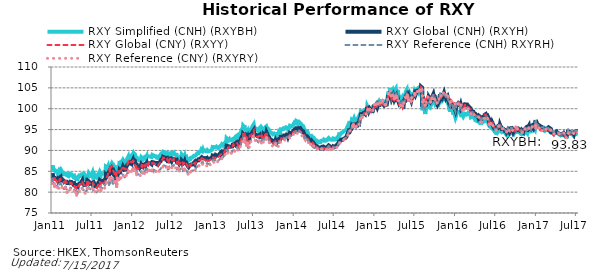
| Category | RXY Simplified (CNH) (RXYBH) | RXY Global (CNH) (RXYH) | RXY Global (CNY) (RXYY) | RXY Reference (CNH) RXYRH) | RXY Reference (CNY) (RXYRY) |
|---|---|---|---|---|---|
| 2017-07-15 | 93.83 | 94.36 | 94.14 | 94.45 | 94.23 |
| 2017-07-14 | 93.82 | 94.37 | 94.18 | 94.46 | 94.27 |
| 2017-07-13 | 93.89 | 94.44 | 94.23 | 94.55 | 94.34 |
| 2017-07-12 | 93.9 | 94.54 | 94.35 | 94.68 | 94.49 |
| 2017-07-11 | 93.97 | 94.63 | 94.47 | 94.78 | 94.63 |
| 2017-07-10 | 93.93 | 94.54 | 94.34 | 94.64 | 94.44 |
| 2017-07-07 | 93.89 | 94.57 | 94.37 | 94.73 | 94.54 |
| 2017-07-06 | 93.92 | 94.61 | 94.4 | 94.76 | 94.55 |
| 2017-07-05 | 93.97 | 94.57 | 94.37 | 94.69 | 94.5 |
| 2017-07-04 | 93.93 | 94.52 | 94.31 | 94.64 | 94.43 |
| 2017-07-03 | 93.89 | 94.49 | 94.25 | 94.6 | 94.37 |
| 2017-06-30 | 93.83 | 94.45 | 94.24 | 94.57 | 94.36 |
| 2017-06-29 | 93.84 | 94.41 | 94.27 | 94.49 | 94.35 |
| 2017-06-28 | 93.8 | 94.33 | 94.17 | 94.43 | 94.27 |
| 2017-06-27 | 93.79 | 94.19 | 93.97 | 94.25 | 94.02 |
| 2017-06-26 | 93.54 | 93.91 | 93.82 | 93.98 | 93.89 |
| 2017-06-23 | 93.69 | 94.1 | 93.86 | 94.19 | 93.96 |
| 2017-06-22 | 93.84 | 94.28 | 94.09 | 94.39 | 94.2 |
| 2017-06-21 | 93.97 | 94.43 | 94.23 | 94.56 | 94.35 |
| 2017-06-20 | 93.8 | 94.14 | 93.94 | 94.24 | 94.04 |
| 2017-06-19 | 93.78 | 94.1 | 93.95 | 94.18 | 94.03 |
| 2017-06-16 | 93.88 | 94.19 | 94.09 | 94.28 | 94.18 |
| 2017-06-15 | 94 | 94.25 | 93.95 | 94.35 | 94.05 |
| 2017-06-14 | 94.08 | 94.26 | 93.96 | 94.36 | 94.06 |
| 2017-06-13 | 94.11 | 94.32 | 94.03 | 94.43 | 94.13 |
| 2017-06-12 | 94.1 | 94.35 | 94.08 | 94.47 | 94.2 |
| 2017-06-09 | 94.25 | 94.44 | 94.1 | 94.57 | 94.23 |
| 2017-06-08 | 94.07 | 94.32 | 93.88 | 94.47 | 94.03 |
| 2017-06-07 | 94.09 | 94.34 | 93.85 | 94.49 | 94 |
| 2017-06-06 | 94.25 | 94.4 | 93.84 | 94.54 | 93.99 |
| 2017-06-05 | 94.22 | 94.35 | 93.84 | 94.47 | 93.96 |
| 2017-06-02 | 94.46 | 94.56 | 94 | 94.71 | 94.16 |
| 2017-06-01 | 94.77 | 94.9 | 94.1 | 95.04 | 94.23 |
| 2017-05-31 | 94.54 | 94.64 | 93.74 | 94.81 | 93.91 |
| 2017-05-30 | 93.97 | 94.09 | 93.45 | 94.22 | 93.58 |
| 2017-05-29 | 94.01 | 94.11 | 93.37 | 94.27 | 93.52 |
| 2017-05-26 | 93.69 | 93.79 | 93.32 | 93.95 | 93.47 |
| 2017-05-25 | 93.32 | 93.39 | 93.06 | 93.58 | 93.24 |
| 2017-05-24 | 93.27 | 93.44 | 93.1 | 93.56 | 93.22 |
| 2017-05-23 | 92.96 | 93.18 | 92.84 | 93.29 | 92.95 |
| 2017-05-22 | 93.2 | 93.32 | 92.96 | 93.51 | 93.15 |
| 2017-05-19 | 93.25 | 93.49 | 93.2 | 93.61 | 93.32 |
| 2017-05-18 | 93.26 | 93.51 | 93.15 | 93.66 | 93.31 |
| 2017-05-17 | 93.62 | 93.69 | 93.37 | 93.93 | 93.61 |
| 2017-05-16 | 93.8 | 93.78 | 93.47 | 94.07 | 93.76 |
| 2017-05-15 | 93.91 | 93.94 | 93.71 | 94.18 | 93.96 |
| 2017-05-12 | 94.06 | 94.12 | 93.92 | 94.37 | 94.17 |
| 2017-05-11 | 94.07 | 94.11 | 93.95 | 94.35 | 94.2 |
| 2017-05-10 | 93.97 | 94.13 | 94.02 | 94.29 | 94.18 |
| 2017-05-09 | 93.87 | 94.01 | 93.86 | 94.2 | 94.05 |
| 2017-05-08 | 93.66 | 93.85 | 93.65 | 94.01 | 93.81 |
| 2017-05-05 | 93.62 | 93.86 | 93.72 | 94.01 | 93.87 |
| 2017-05-04 | 93.89 | 94.07 | 93.85 | 94.23 | 94.01 |
| 2017-05-03 | 93.71 | 93.89 | 93.65 | 94.04 | 93.8 |
| 2017-05-02 | 93.65 | 93.86 | 93.61 | 94.01 | 93.77 |
| 2017-05-01 | 93.62 | 93.89 | 93.72 | 93.98 | 93.8 |
| 2017-04-28 | 93.59 | 93.87 | 93.67 | 93.95 | 93.75 |
| 2017-04-27 | 93.53 | 93.72 | 93.6 | 93.87 | 93.75 |
| 2017-04-26 | 93.58 | 93.7 | 93.55 | 93.9 | 93.75 |
| 2017-04-25 | 93.57 | 93.73 | 93.52 | 93.9 | 93.69 |
| 2017-04-24 | 93.58 | 93.78 | 93.58 | 93.92 | 93.71 |
| 2017-04-21 | 93.87 | 94.05 | 93.84 | 94.16 | 93.96 |
| 2017-04-20 | 93.84 | 94.08 | 93.81 | 94.13 | 93.86 |
| 2017-04-19 | 93.83 | 94.04 | 93.8 | 94.09 | 93.85 |
| 2017-04-18 | 94.01 | 94.21 | 93.96 | 94.26 | 94.01 |
| 2017-04-17 | 93.96 | 94.15 | 93.87 | 94.23 | 93.95 |
| 2017-04-14 | 94.11 | 94.2 | 94.02 | 94.39 | 94.22 |
| 2017-04-13 | 94.03 | 94.18 | 93.91 | 94.36 | 94.09 |
| 2017-04-12 | 94.12 | 94.31 | 94.16 | 94.4 | 94.25 |
| 2017-04-11 | 94.21 | 94.41 | 94.26 | 94.48 | 94.34 |
| 2017-04-10 | 94.34 | 94.51 | 94.31 | 94.65 | 94.45 |
| 2017-04-07 | 94.24 | 94.39 | 94.1 | 94.57 | 94.28 |
| 2017-04-06 | 94.23 | 94.36 | 94.04 | 94.54 | 94.23 |
| 2017-04-05 | 94.24 | 94.28 | 93.88 | 94.54 | 94.14 |
| 2017-04-04 | 94.33 | 94.37 | 93.99 | 94.67 | 94.28 |
| 2017-04-03 | 94.35 | 94.3 | 93.87 | 94.66 | 94.23 |
| 2017-03-31 | 94.23 | 94.22 | 93.89 | 94.55 | 94.21 |
| 2017-03-30 | 94.06 | 94.1 | 93.73 | 94.42 | 94.05 |
| 2017-03-29 | 94.09 | 94.15 | 93.69 | 94.49 | 94.03 |
| 2017-03-28 | 93.95 | 94.01 | 93.56 | 94.33 | 93.89 |
| 2017-03-27 | 94.02 | 94.1 | 93.59 | 94.41 | 93.9 |
| 2017-03-24 | 94.09 | 94.22 | 93.83 | 94.49 | 94.1 |
| 2017-03-23 | 94.12 | 94.27 | 93.84 | 94.53 | 94.1 |
| 2017-03-22 | 94.16 | 94.35 | 93.87 | 94.61 | 94.13 |
| 2017-03-21 | 94.06 | 94.2 | 93.87 | 94.51 | 94.17 |
| 2017-03-20 | 93.94 | 94.1 | 93.72 | 94.41 | 94.02 |
| 2017-03-17 | 94.22 | 94.46 | 94.06 | 94.69 | 94.3 |
| 2017-03-16 | 94.58 | 94.84 | 94.29 | 95.07 | 94.52 |
| 2017-03-15 | 94.83 | 95.14 | 94.68 | 95.32 | 94.86 |
| 2017-03-14 | 94.78 | 95.1 | 94.74 | 95.25 | 94.88 |
| 2017-03-13 | 94.7 | 95.05 | 94.68 | 95.21 | 94.84 |
| 2017-03-10 | 94.94 | 95.32 | 95 | 95.39 | 95.07 |
| 2017-03-09 | 95.01 | 95.37 | 95.06 | 95.44 | 95.14 |
| 2017-03-08 | 94.68 | 94.94 | 94.84 | 95.11 | 95 |
| 2017-03-07 | 94.73 | 95.02 | 94.76 | 95.16 | 94.89 |
| 2017-03-06 | 94.77 | 95.17 | 94.92 | 95.19 | 94.94 |
| 2017-03-03 | 94.99 | 95.32 | 95.06 | 95.39 | 95.13 |
| 2017-03-02 | 95.1 | 95.32 | 95.01 | 95.52 | 95.21 |
| 2017-03-01 | 95.07 | 95.2 | 94.85 | 95.49 | 95.14 |
| 2017-02-28 | 94.89 | 95.06 | 94.66 | 95.31 | 94.91 |
| 2017-02-27 | 94.83 | 94.99 | 94.62 | 95.2 | 94.84 |
| 2017-02-24 | 94.9 | 95.06 | 94.62 | 95.29 | 94.85 |
| 2017-02-23 | 95.06 | 95.2 | 94.82 | 95.4 | 95.02 |
| 2017-02-22 | 95.17 | 95.31 | 94.93 | 95.47 | 95.09 |
| 2017-02-21 | 95.1 | 95.28 | 94.81 | 95.41 | 94.94 |
| 2017-02-20 | 95.12 | 95.36 | 94.82 | 95.45 | 94.91 |
| 2017-02-17 | 94.99 | 95.22 | 94.8 | 95.31 | 94.88 |
| 2017-02-16 | 95.27 | 95.39 | 94.98 | 95.55 | 95.13 |
| 2017-02-15 | 95.38 | 95.43 | 95.03 | 95.59 | 95.2 |
| 2017-02-14 | 95.04 | 95.13 | 94.8 | 95.32 | 94.99 |
| 2017-02-13 | 94.8 | 95.06 | 94.81 | 95.1 | 94.85 |
| 2017-02-10 | 95.03 | 95.29 | 94.91 | 95.37 | 94.98 |
| 2017-02-09 | 94.91 | 95.18 | 94.83 | 95.27 | 94.91 |
| 2017-02-08 | 94.97 | 95.27 | 94.66 | 95.35 | 94.74 |
| 2017-02-07 | 95.24 | 95.51 | 94.63 | 95.61 | 94.73 |
| 2017-02-06 | 95.29 | 95.52 | 94.58 | 95.66 | 94.72 |
| 2017-02-03 | 95.25 | 95.58 | 94.67 | 95.63 | 94.72 |
| 2017-02-02 | 95.09 | 95.48 | 94.45 | 95.53 | 94.5 |
| 2017-02-01 | 95.09 | 95.55 | 94.76 | 95.51 | 94.73 |
| 2017-01-31 | 95.07 | 95.49 | 94.98 | 95.44 | 94.93 |
| 2017-01-30 | 95.11 | 95.45 | 95.11 | 95.45 | 95.12 |
| 2017-01-27 | 95.21 | 95.51 | 95.22 | 95.53 | 95.24 |
| 2017-01-26 | 95.3 | 95.71 | 94.84 | 95.68 | 94.81 |
| 2017-01-25 | 95.43 | 95.86 | 94.99 | 95.77 | 94.9 |
| 2017-01-24 | 95.53 | 96.02 | 95.26 | 95.92 | 95.16 |
| 2017-01-23 | 95.42 | 95.93 | 95.25 | 95.83 | 95.16 |
| 2017-01-20 | 95.57 | 96.05 | 95.43 | 95.96 | 95.35 |
| 2017-01-19 | 95.77 | 96.27 | 95.62 | 96.12 | 95.47 |
| 2017-01-18 | 95.74 | 96.17 | 95.58 | 96.08 | 95.49 |
| 2017-01-17 | 95.66 | 96.17 | 95.29 | 96.02 | 95.14 |
| 2017-01-16 | 95.62 | 96.13 | 95.41 | 95.94 | 95.22 |
| 2017-01-13 | 95.83 | 96.27 | 95.33 | 96.15 | 95.21 |
| 2017-01-12 | 95.2 | 95.74 | 95.14 | 95.51 | 94.91 |
| 2017-01-11 | 95.53 | 96.09 | 95.53 | 95.82 | 95.26 |
| 2017-01-10 | 95.6 | 96.16 | 95.44 | 95.89 | 95.18 |
| 2017-01-09 | 96.16 | 96.76 | 95.8 | 96.41 | 95.45 |
| 2017-01-06 | 96.19 | 96.71 | 95.5 | 96.47 | 95.26 |
| 2017-01-05 | 96.79 | 97.3 | 96.14 | 97.12 | 95.97 |
| 2017-01-04 | 95.9 | 96.47 | 95.92 | 96.2 | 95.66 |
| 2017-01-03 | 95.29 | 95.81 | 95.79 | 95.56 | 95.54 |
| 2017-01-02 | 94.98 | 95.59 | 95.7 | 95.27 | 95.37 |
| 2016-12-30 | 94.87 | 95.47 | 95.73 | 95.15 | 95.41 |
| 2016-12-29 | 95.09 | 95.66 | 95.71 | 95.35 | 95.4 |
| 2016-12-28 | 95.4 | 96.01 | 95.86 | 95.69 | 95.53 |
| 2016-12-27 | 95.45 | 96.03 | 95.92 | 95.74 | 95.63 |
| 2016-12-26 | 95.43 | 95.98 | 95.87 | 95.73 | 95.62 |
| 2016-12-23 | 95.56 | 96.1 | 95.88 | 95.86 | 95.63 |
| 2016-12-22 | 95.65 | 96.14 | 95.86 | 95.93 | 95.65 |
| 2016-12-21 | 95.67 | 96.14 | 95.79 | 95.98 | 95.64 |
| 2016-12-20 | 95.66 | 96.14 | 95.86 | 96 | 95.72 |
| 2016-12-19 | 95.34 | 95.8 | 95.61 | 95.69 | 95.49 |
| 2016-12-16 | 95.57 | 96.02 | 95.6 | 95.94 | 95.53 |
| 2016-12-15 | 95.31 | 95.75 | 95.52 | 95.7 | 95.47 |
| 2016-12-14 | 94.57 | 95.07 | 95.04 | 94.99 | 94.96 |
| 2016-12-13 | 94.52 | 94.97 | 95.13 | 94.93 | 95.09 |
| 2016-12-12 | 94.73 | 95.12 | 95.22 | 95.1 | 95.2 |
| 2016-12-09 | 94.55 | 95.12 | 95.23 | 95.1 | 95.21 |
| 2016-12-08 | 94.44 | 95.06 | 95.05 | 95.06 | 95.06 |
| 2016-12-07 | 94.6 | 95.25 | 95.27 | 95.2 | 95.21 |
| 2016-12-06 | 94.76 | 95.52 | 95.31 | 95.4 | 95.19 |
| 2016-12-05 | 95.2 | 95.91 | 95.51 | 95.81 | 95.41 |
| 2016-12-02 | 95.06 | 95.79 | 95.53 | 95.7 | 95.44 |
| 2016-12-01 | 94.93 | 95.55 | 95.48 | 95.53 | 95.46 |
| 2016-11-30 | 94.68 | 95.47 | 95.47 | 95.42 | 95.42 |
| 2016-11-29 | 94.52 | 95.28 | 95.38 | 95.23 | 95.33 |
| 2016-11-28 | 94.18 | 94.99 | 95.08 | 94.9 | 94.99 |
| 2016-11-25 | 94.35 | 95.14 | 95.25 | 95.03 | 95.14 |
| 2016-11-24 | 94.47 | 95.19 | 95.42 | 95.08 | 95.3 |
| 2016-11-23 | 94.28 | 95.06 | 95.22 | 94.91 | 95.08 |
| 2016-11-22 | 94.45 | 95.16 | 95.23 | 95.01 | 95.08 |
| 2016-11-21 | 94.52 | 95.34 | 95.33 | 95.09 | 95.09 |
| 2016-11-18 | 94.5 | 95.35 | 95.41 | 95.15 | 95.21 |
| 2016-11-17 | 94.24 | 95.13 | 95.09 | 94.92 | 94.88 |
| 2016-11-16 | 94.25 | 95.04 | 94.98 | 94.9 | 94.84 |
| 2016-11-15 | 94.07 | 95.01 | 94.93 | 94.81 | 94.73 |
| 2016-11-14 | 94.28 | 95.24 | 95.17 | 95.02 | 94.95 |
| 2016-11-11 | 94 | 94.91 | 94.92 | 94.7 | 94.71 |
| 2016-11-10 | 93.94 | 94.7 | 94.74 | 94.58 | 94.62 |
| 2016-11-09 | 93.48 | 94.36 | 94.39 | 94.17 | 94.2 |
| 2016-11-08 | 93.71 | 94.4 | 94.36 | 94.38 | 94.33 |
| 2016-11-07 | 93.8 | 94.58 | 94.52 | 94.49 | 94.42 |
| 2016-11-04 | 93.71 | 94.55 | 94.47 | 94.42 | 94.33 |
| 2016-11-03 | 93.63 | 94.4 | 94.33 | 94.3 | 94.22 |
| 2016-11-02 | 93.89 | 94.7 | 94.62 | 94.52 | 94.44 |
| 2016-11-01 | 94.11 | 94.78 | 94.67 | 94.74 | 94.63 |
| 2016-10-31 | 94.3 | 94.97 | 94.9 | 94.9 | 94.84 |
| 2016-10-28 | 94.35 | 94.96 | 94.9 | 94.91 | 94.85 |
| 2016-10-27 | 94.27 | 94.91 | 94.8 | 94.86 | 94.75 |
| 2016-10-26 | 94.17 | 94.72 | 94.65 | 94.73 | 94.67 |
| 2016-10-25 | 94.33 | 94.79 | 94.68 | 94.83 | 94.72 |
| 2016-10-24 | 94.34 | 94.82 | 94.7 | 94.87 | 94.76 |
| 2016-10-21 | 94.44 | 94.96 | 94.88 | 94.98 | 94.9 |
| 2016-10-20 | 94.46 | 94.96 | 94.84 | 95.02 | 94.9 |
| 2016-10-19 | 94.42 | 94.9 | 94.75 | 94.99 | 94.84 |
| 2016-10-18 | 94.41 | 94.99 | 94.85 | 95.02 | 94.89 |
| 2016-10-17 | 94.64 | 95.28 | 95.2 | 95.27 | 95.19 |
| 2016-10-14 | 94.7 | 95.3 | 95.24 | 95.34 | 95.27 |
| 2016-10-13 | 94.72 | 95.42 | 95.35 | 95.42 | 95.36 |
| 2016-10-12 | 94.67 | 95.27 | 95.11 | 95.36 | 95.21 |
| 2016-10-11 | 94.62 | 95.12 | 94.98 | 95.23 | 95.1 |
| 2016-10-10 | 94.41 | 94.86 | 94.74 | 95.06 | 94.94 |
| 2016-10-07 | 94.63 | 95.09 | 95.45 | 95.23 | 95.6 |
| 2016-10-06 | 94.51 | 94.97 | 95.14 | 95.11 | 95.28 |
| 2016-10-05 | 94.36 | 94.88 | 94.98 | 94.99 | 95.08 |
| 2016-10-04 | 94.43 | 94.89 | 94.88 | 95.05 | 95.04 |
| 2016-10-03 | 94.2 | 94.66 | 94.55 | 94.85 | 94.74 |
| 2016-09-30 | 94.24 | 94.7 | 94.64 | 94.9 | 94.85 |
| 2016-09-29 | 94.14 | 94.58 | 94.51 | 94.8 | 94.72 |
| 2016-09-28 | 94.03 | 94.56 | 94.52 | 94.8 | 94.76 |
| 2016-09-27 | 93.92 | 94.43 | 94.39 | 94.65 | 94.61 |
| 2016-09-26 | 94.07 | 94.7 | 94.63 | 94.83 | 94.76 |
| 2016-09-23 | 94.16 | 94.7 | 94.6 | 94.88 | 94.78 |
| 2016-09-22 | 93.94 | 94.54 | 94.45 | 94.69 | 94.61 |
| 2016-09-21 | 94.4 | 95.12 | 95.05 | 95.17 | 95.09 |
| 2016-09-20 | 94.37 | 95.14 | 94.99 | 95.17 | 95.02 |
| 2016-09-19 | 94.66 | 95.36 | 95.14 | 95.44 | 95.22 |
| 2016-09-16 | 94.76 | 95.5 | 94.95 | 95.55 | 95 |
| 2016-09-15 | 94.62 | 95.33 | 95.13 | 95.4 | 95.2 |
| 2016-09-14 | 94.63 | 95.31 | 95.15 | 95.38 | 95.22 |
| 2016-09-13 | 94.1 | 94.82 | 94.74 | 94.85 | 94.77 |
| 2016-09-12 | 94.13 | 94.77 | 94.71 | 94.86 | 94.8 |
| 2016-09-09 | 93.87 | 94.39 | 94.32 | 94.6 | 94.53 |
| 2016-09-08 | 93.89 | 94.36 | 94.24 | 94.6 | 94.48 |
| 2016-09-07 | 93.98 | 94.43 | 94.3 | 94.71 | 94.58 |
| 2016-09-06 | 94.24 | 94.79 | 94.72 | 94.98 | 94.91 |
| 2016-09-05 | 94.3 | 94.83 | 94.79 | 95.02 | 94.98 |
| 2016-09-02 | 94.36 | 95.07 | 95.01 | 95.16 | 95.1 |
| 2016-09-01 | 94.6 | 95.26 | 95.2 | 95.32 | 95.26 |
| 2016-08-31 | 94.58 | 95.14 | 95.08 | 95.26 | 95.21 |
| 2016-08-30 | 94.33 | 94.95 | 94.89 | 94.99 | 94.93 |
| 2016-08-29 | 94.28 | 94.97 | 94.93 | 94.95 | 94.92 |
| 2016-08-26 | 93.76 | 94.41 | 94.4 | 94.43 | 94.42 |
| 2016-08-25 | 93.94 | 94.62 | 94.61 | 94.62 | 94.61 |
| 2016-08-24 | 93.95 | 94.71 | 94.68 | 94.65 | 94.62 |
| 2016-08-23 | 93.92 | 94.66 | 94.6 | 94.64 | 94.58 |
| 2016-08-22 | 94.04 | 94.79 | 94.72 | 94.69 | 94.62 |
| 2016-08-19 | 93.99 | 94.68 | 94.58 | 94.65 | 94.54 |
| 2016-08-18 | 94.11 | 94.71 | 94.62 | 94.76 | 94.67 |
| 2016-08-17 | 94.34 | 94.95 | 94.82 | 95.02 | 94.89 |
| 2016-08-16 | 94.26 | 94.72 | 94.61 | 94.95 | 94.83 |
| 2016-08-15 | 94.47 | 95.02 | 94.91 | 95.18 | 95.07 |
| 2016-08-12 | 94.6 | 95.16 | 95.06 | 95.35 | 95.25 |
| 2016-08-11 | 94.53 | 95.13 | 94.98 | 95.34 | 95.19 |
| 2016-08-10 | 94.4 | 94.96 | 94.86 | 95.21 | 95.11 |
| 2016-08-09 | 94.58 | 95.2 | 95.11 | 95.4 | 95.31 |
| 2016-08-08 | 94.56 | 95.23 | 95.13 | 95.4 | 95.3 |
| 2016-08-05 | 94.41 | 95.16 | 95.06 | 95.27 | 95.17 |
| 2016-08-04 | 94.63 | 95.48 | 95.33 | 95.57 | 95.42 |
| 2016-08-03 | 94.52 | 95.47 | 95.35 | 95.5 | 95.38 |
| 2016-08-02 | 94.55 | 95.37 | 95.24 | 95.5 | 95.36 |
| 2016-08-01 | 94.72 | 95.45 | 95.28 | 95.6 | 95.43 |
| 2016-07-29 | 95.03 | 95.85 | 95.73 | 95.95 | 95.83 |
| 2016-07-28 | 94.99 | 95.81 | 95.69 | 95.86 | 95.75 |
| 2016-07-27 | 95.32 | 96.14 | 96.02 | 96.15 | 96.03 |
| 2016-07-26 | 95 | 95.85 | 95.71 | 95.83 | 95.69 |
| 2016-07-25 | 95.35 | 96.1 | 96.02 | 96.1 | 96.01 |
| 2016-07-22 | 95.34 | 96.07 | 95.92 | 96.07 | 95.91 |
| 2016-07-21 | 95.36 | 96.04 | 95.88 | 96.02 | 95.86 |
| 2016-07-20 | 95.26 | 95.92 | 95.79 | 95.85 | 95.72 |
| 2016-07-19 | 94.76 | 95.38 | 95.35 | 95.33 | 95.29 |
| 2016-07-18 | 94.48 | 95.15 | 95.07 | 95.07 | 94.99 |
| 2016-07-15 | 94.5 | 95.2 | 95.08 | 95.11 | 94.99 |
| 2016-07-14 | 94.51 | 95.23 | 95.13 | 95.12 | 95.03 |
| 2016-07-13 | 94.51 | 95.38 | 95.25 | 95.19 | 95.06 |
| 2016-07-12 | 94.14 | 95.07 | 95.05 | 94.83 | 94.81 |
| 2016-07-11 | 94.37 | 95.24 | 95.2 | 95.04 | 94.99 |
| 2016-07-08 | 94.15 | 95.22 | 95.15 | 94.84 | 94.77 |
| 2016-07-07 | 94.23 | 95.2 | 95.13 | 94.9 | 94.83 |
| 2016-07-06 | 94.29 | 95.36 | 95.3 | 94.96 | 94.9 |
| 2016-07-05 | 94.27 | 95.26 | 95.24 | 94.93 | 94.91 |
| 2016-07-04 | 94.48 | 95.34 | 95.31 | 95.1 | 95.07 |
| 2016-07-01 | 94.65 | 95.51 | 95.47 | 95.3 | 95.26 |
| 2016-06-30 | 94.81 | 95.76 | 95.78 | 95.49 | 95.51 |
| 2016-06-29 | 94.77 | 95.82 | 95.86 | 95.49 | 95.53 |
| 2016-06-28 | 94.65 | 95.8 | 96.02 | 95.36 | 95.58 |
| 2016-06-27 | 94.82 | 96.15 | 96.26 | 95.6 | 95.71 |
| 2016-06-24 | 95.17 | 96.5 | 96.67 | 95.98 | 96.14 |
| 2016-06-23 | 94.99 | 96.13 | 96.06 | 95.79 | 95.72 |
| 2016-06-22 | 95.21 | 96.3 | 96.23 | 95.94 | 95.87 |
| 2016-06-21 | 95.14 | 96.31 | 96.24 | 95.92 | 95.85 |
| 2016-06-20 | 95.22 | 96.43 | 96.33 | 96.01 | 95.91 |
| 2016-06-17 | 95.48 | 96.82 | 96.74 | 96.33 | 96.26 |
| 2016-06-16 | 95.51 | 96.85 | 96.78 | 96.37 | 96.31 |
| 2016-06-15 | 95.78 | 97.05 | 97.07 | 96.6 | 96.63 |
| 2016-06-14 | 95.8 | 97.09 | 96.99 | 96.63 | 96.54 |
| 2016-06-13 | 95.76 | 97 | 96.97 | 96.53 | 96.5 |
| 2016-06-10 | 95.8 | 96.93 | 96.99 | 96.53 | 96.58 |
| 2016-06-09 | 95.7 | 96.73 | 96.59 | 96.37 | 96.23 |
| 2016-06-08 | 95.82 | 96.93 | 96.77 | 96.59 | 96.44 |
| 2016-06-07 | 95.97 | 97.16 | 96.97 | 96.78 | 96.59 |
| 2016-06-06 | 96.17 | 97.61 | 97.43 | 97.04 | 96.87 |
| 2016-06-03 | 96.74 | 98.1 | 97.95 | 97.64 | 97.5 |
| 2016-06-02 | 96.78 | 98.17 | 98.03 | 97.68 | 97.54 |
| 2016-06-01 | 96.83 | 98.25 | 98.13 | 97.72 | 97.6 |
| 2016-05-31 | 97.13 | 98.44 | 98.31 | 97.94 | 97.8 |
| 2016-05-30 | 97.27 | 98.54 | 98.42 | 98.05 | 97.93 |
| 2016-05-27 | 97.12 | 98.33 | 98.2 | 97.91 | 97.78 |
| 2016-05-26 | 97.27 | 98.4 | 98.23 | 97.96 | 97.8 |
| 2016-05-25 | 97.33 | 98.54 | 98.41 | 98.11 | 97.97 |
| 2016-05-24 | 97.32 | 98.71 | 98.64 | 98.18 | 98.11 |
| 2016-05-23 | 97.2 | 98.51 | 98.44 | 98.05 | 97.98 |
| 2016-05-20 | 97.29 | 98.61 | 98.61 | 98.09 | 98.08 |
| 2016-05-19 | 97.22 | 98.54 | 98.63 | 98 | 98.08 |
| 2016-05-18 | 97.12 | 98.29 | 98.36 | 97.8 | 97.86 |
| 2016-05-17 | 96.96 | 98.06 | 98.14 | 97.6 | 97.68 |
| 2016-05-16 | 96.95 | 98.11 | 98.24 | 97.61 | 97.74 |
| 2016-05-13 | 96.97 | 98.03 | 98.14 | 97.6 | 97.71 |
| 2016-05-12 | 96.82 | 97.82 | 98.04 | 97.46 | 97.68 |
| 2016-05-11 | 96.83 | 98 | 98.15 | 97.61 | 97.76 |
| 2016-05-10 | 96.81 | 98.05 | 98.2 | 97.61 | 97.77 |
| 2016-05-09 | 96.94 | 98.08 | 98.05 | 97.68 | 97.65 |
| 2016-05-06 | 96.7 | 97.8 | 97.8 | 97.49 | 97.49 |
| 2016-05-05 | 96.57 | 97.7 | 97.63 | 97.37 | 97.3 |
| 2016-05-04 | 96.5 | 97.64 | 97.58 | 97.29 | 97.22 |
| 2016-05-03 | 96.19 | 97.19 | 97.07 | 96.88 | 96.76 |
| 2016-05-02 | 96.52 | 97.43 | 97.24 | 97.2 | 97.01 |
| 2016-04-29 | 96.73 | 97.59 | 97.45 | 97.36 | 97.23 |
| 2016-04-28 | 96.94 | 97.83 | 97.72 | 97.65 | 97.55 |
| 2016-04-27 | 97.22 | 98.15 | 98.12 | 97.93 | 97.89 |
| 2016-04-26 | 97.15 | 98.24 | 98.21 | 98 | 97.97 |
| 2016-04-25 | 97.25 | 98.26 | 98.19 | 98.07 | 98 |
| 2016-04-22 | 97.31 | 98.29 | 98.12 | 98.13 | 97.96 |
| 2016-04-21 | 97.24 | 98.09 | 97.95 | 97.99 | 97.85 |
| 2016-04-20 | 97.07 | 98.03 | 97.91 | 97.89 | 97.77 |
| 2016-04-19 | 97.19 | 98.11 | 97.96 | 97.97 | 97.82 |
| 2016-04-18 | 97.23 | 98.39 | 98.32 | 98.14 | 98.08 |
| 2016-04-15 | 97.44 | 98.35 | 98.23 | 98.15 | 98.03 |
| 2016-04-14 | 97.42 | 98.42 | 98.38 | 98.12 | 98.08 |
| 2016-04-13 | 97.32 | 98.26 | 98.2 | 98.03 | 97.96 |
| 2016-04-12 | 97.12 | 98.18 | 98.1 | 97.93 | 97.84 |
| 2016-04-11 | 97.24 | 98.32 | 98.24 | 98.09 | 98.01 |
| 2016-04-08 | 97.3 | 98.46 | 98.4 | 98.18 | 98.13 |
| 2016-04-07 | 97.24 | 98.45 | 98.39 | 98.18 | 98.13 |
| 2016-04-06 | 97.57 | 98.81 | 98.71 | 98.54 | 98.45 |
| 2016-04-05 | 97.66 | 98.92 | 98.82 | 98.67 | 98.57 |
| 2016-04-04 | 97.7 | 98.85 | 98.83 | 98.69 | 98.67 |
| 2016-04-01 | 97.75 | 98.91 | 98.79 | 98.65 | 98.53 |
| 2016-03-31 | 97.86 | 98.96 | 98.83 | 98.84 | 98.7 |
| 2016-03-30 | 97.63 | 98.84 | 98.73 | 98.64 | 98.52 |
| 2016-03-29 | 98.06 | 99.29 | 99.15 | 99.06 | 98.92 |
| 2016-03-28 | 98.02 | 99.24 | 99.13 | 98.99 | 98.88 |
| 2016-03-25 | 97.94 | 99.25 | 99.13 | 99.01 | 98.88 |
| 2016-03-24 | 98.07 | 99.36 | 99.24 | 99.12 | 99.01 |
| 2016-03-23 | 98.01 | 99.19 | 99.06 | 98.96 | 98.82 |
| 2016-03-22 | 97.89 | 99.04 | 98.84 | 98.84 | 98.64 |
| 2016-03-21 | 97.92 | 99.31 | 99.05 | 99.02 | 98.76 |
| 2016-03-18 | 97.93 | 99.33 | 99.13 | 99.03 | 98.83 |
| 2016-03-17 | 97.79 | 99.27 | 99.04 | 98.89 | 98.66 |
| 2016-03-16 | 98.45 | 100.11 | 99.87 | 99.66 | 99.43 |
| 2016-03-15 | 98.44 | 100.08 | 99.79 | 99.67 | 99.37 |
| 2016-03-14 | 98.54 | 100.14 | 99.86 | 99.72 | 99.45 |
| 2016-03-11 | 98.58 | 100.23 | 99.97 | 99.74 | 99.48 |
| 2016-03-10 | 98.66 | 100.39 | 100.21 | 99.86 | 99.68 |
| 2016-03-09 | 98.58 | 100.51 | 100.33 | 99.85 | 99.68 |
| 2016-03-08 | 98.65 | 100.46 | 100.28 | 99.89 | 99.71 |
| 2016-03-07 | 98.81 | 100.54 | 100.31 | 100.05 | 99.82 |
| 2016-03-04 | 98.95 | 100.76 | 100.41 | 100.27 | 99.92 |
| 2016-03-03 | 98.87 | 100.71 | 100.5 | 100.16 | 99.95 |
| 2016-03-02 | 99.02 | 100.9 | 100.7 | 100.24 | 100.05 |
| 2016-03-01 | 98.99 | 101 | 100.79 | 100.24 | 100.03 |
| 2016-02-29 | 98.88 | 101.02 | 100.82 | 100.27 | 100.07 |
| 2016-02-26 | 98.61 | 100.83 | 100.62 | 100.02 | 99.81 |
| 2016-02-25 | 98.72 | 100.99 | 100.83 | 100.19 | 100.03 |
| 2016-02-24 | 98.78 | 101.05 | 100.88 | 100.3 | 100.13 |
| 2016-02-23 | 98.61 | 100.8 | 100.69 | 100.05 | 99.95 |
| 2016-02-22 | 98.79 | 101.05 | 100.92 | 100.28 | 100.15 |
| 2016-02-19 | 98.8 | 101.06 | 100.92 | 100.29 | 100.15 |
| 2016-02-18 | 98.88 | 100.97 | 100.83 | 100.27 | 100.12 |
| 2016-02-17 | 98.75 | 101.02 | 100.83 | 100.33 | 100.14 |
| 2016-02-16 | 98.89 | 100.94 | 100.8 | 100.34 | 100.2 |
| 2016-02-15 | 98.95 | 101.05 | 100.87 | 100.51 | 100.33 |
| 2016-02-12 | 98.1 | 100.38 | 99.62 | 99.8 | 99.04 |
| 2016-02-11 | 98.05 | 100.19 | 99.47 | 99.68 | 98.97 |
| 2016-02-10 | 98.16 | 100.21 | 99.75 | 99.81 | 99.34 |
| 2016-02-09 | 98.21 | 100.14 | 100.02 | 99.77 | 99.65 |
| 2016-02-08 | 98.5 | 100.35 | 100.18 | 100 | 99.83 |
| 2016-02-05 | 98.05 | 100 | 99.93 | 99.62 | 99.55 |
| 2016-02-04 | 98.07 | 99.87 | 100.21 | 99.49 | 99.83 |
| 2016-02-03 | 98.63 | 100.61 | 101.37 | 100.19 | 100.94 |
| 2016-02-02 | 99 | 100.81 | 101.18 | 100.5 | 100.87 |
| 2016-02-01 | 99.43 | 101.02 | 101.2 | 100.78 | 100.97 |
| 2016-01-29 | 98.92 | 100.5 | 100.93 | 100.24 | 100.67 |
| 2016-01-28 | 99.02 | 100.82 | 101.13 | 100.48 | 100.8 |
| 2016-01-27 | 99 | 100.87 | 101.13 | 100.61 | 100.86 |
| 2016-01-26 | 99.15 | 101.17 | 101.42 | 100.93 | 101.18 |
| 2016-01-25 | 99.24 | 100.97 | 101.22 | 100.81 | 101.07 |
| 2016-01-22 | 99.21 | 101.2 | 101.37 | 101 | 101.17 |
| 2016-01-21 | 99.06 | 101.37 | 101.67 | 101.06 | 101.36 |
| 2016-01-20 | 99.21 | 101.34 | 101.43 | 100.99 | 101.07 |
| 2016-01-19 | 99.36 | 101.32 | 101.43 | 101.06 | 101.17 |
| 2016-01-18 | 99.4 | 101.45 | 101.44 | 101.13 | 101.12 |
| 2016-01-15 | 99.08 | 100.98 | 101.23 | 100.64 | 100.88 |
| 2016-01-14 | 99.32 | 101.23 | 101.22 | 100.87 | 100.86 |
| 2016-01-13 | 99.71 | 101.53 | 101.28 | 101.27 | 101.02 |
| 2016-01-12 | 99.33 | 101.22 | 101.2 | 100.87 | 100.86 |
| 2016-01-11 | 98.33 | 100.16 | 100.97 | 99.81 | 100.61 |
| 2016-01-08 | 97.87 | 99.48 | 100.71 | 99.24 | 100.46 |
| 2016-01-07 | 97.96 | 99.66 | 100.89 | 99.42 | 100.65 |
| 2016-01-06 | 97.96 | 99.54 | 101.5 | 99.33 | 101.28 |
| 2016-01-05 | 98.45 | 99.95 | 101.59 | 99.8 | 101.43 |
| 2016-01-04 | 98.53 | 100.09 | 101.43 | 99.9 | 101.24 |
| 2016-01-01 | 99.39 | 100.76 | 101.7 | 100.74 | 101.68 |
| 2015-12-31 | 99.1 | 100.56 | 101.55 | 100.51 | 101.51 |
| 2015-12-30 | 98.64 | 100.04 | 101.57 | 100 | 101.52 |
| 2015-12-29 | 98.91 | 100.33 | 101.5 | 100.3 | 101.47 |
| 2015-12-28 | 99.36 | 100.66 | 101.39 | 100.66 | 101.4 |
| 2015-12-25 | 99.46 | 100.77 | 101.51 | 100.74 | 101.48 |
| 2015-12-24 | 99.49 | 100.77 | 101.49 | 100.74 | 101.46 |
| 2015-12-23 | 99.7 | 101.07 | 101.77 | 101.02 | 101.71 |
| 2015-12-22 | 99.74 | 101.14 | 101.81 | 101.09 | 101.76 |
| 2015-12-21 | 99.76 | 101.11 | 102 | 101.05 | 101.94 |
| 2015-12-18 | 99.73 | 101.1 | 102.12 | 100.99 | 102.01 |
| 2015-12-17 | 99.94 | 101.25 | 102.1 | 101.17 | 102.02 |
| 2015-12-16 | 100.01 | 101.32 | 101.95 | 101.24 | 101.87 |
| 2015-12-15 | 99.3 | 100.79 | 101.77 | 100.59 | 101.56 |
| 2015-12-14 | 99.55 | 100.97 | 102.07 | 100.78 | 101.88 |
| 2015-12-11 | 99.82 | 101.1 | 102 | 100.96 | 101.86 |
| 2015-12-10 | 99.82 | 101.15 | 102.14 | 100.96 | 101.95 |
| 2015-12-09 | 100.6 | 101.84 | 102.67 | 101.72 | 102.55 |
| 2015-12-08 | 100.83 | 102.02 | 102.88 | 101.93 | 102.79 |
| 2015-12-07 | 101.07 | 102.1 | 102.75 | 102.1 | 102.75 |
| 2015-12-04 | 101.41 | 102.33 | 102.63 | 102.42 | 102.72 |
| 2015-12-03 | 102.12 | 102.95 | 103.46 | 103.05 | 103.57 |
| 2015-12-02 | 102.04 | 102.83 | 103.24 | 102.91 | 103.32 |
| 2015-12-01 | 102.1 | 102.77 | 103.25 | 102.92 | 103.41 |
| 2015-11-30 | 102.42 | 103.1 | 103.39 | 103.27 | 103.57 |
| 2015-11-27 | 101.87 | 102.49 | 103.18 | 102.69 | 103.39 |
| 2015-11-26 | 102.27 | 102.76 | 103.19 | 103.02 | 103.46 |
| 2015-11-25 | 102.13 | 102.62 | 102.88 | 102.88 | 103.15 |
| 2015-11-24 | 102.32 | 102.88 | 103.26 | 103.07 | 103.45 |
| 2015-11-23 | 102.41 | 103.01 | 103.46 | 103.17 | 103.62 |
| 2015-11-20 | 102.43 | 103 | 103.21 | 103.17 | 103.38 |
| 2015-11-19 | 102.66 | 103.32 | 103.58 | 103.44 | 103.7 |
| 2015-11-18 | 102.82 | 103.54 | 103.76 | 103.56 | 103.79 |
| 2015-11-17 | 103.03 | 103.77 | 103.91 | 103.83 | 103.97 |
| 2015-11-16 | 102.73 | 103.63 | 103.83 | 103.61 | 103.81 |
| 2015-11-13 | 102.39 | 103.19 | 103.58 | 103.27 | 103.66 |
| 2015-11-12 | 102.77 | 103.44 | 103.61 | 103.58 | 103.75 |
| 2015-11-11 | 102.92 | 103.44 | 103.62 | 103.61 | 103.79 |
| 2015-11-10 | 103.04 | 103.56 | 103.77 | 103.72 | 103.93 |
| 2015-11-09 | 103.06 | 103.56 | 103.79 | 103.72 | 103.95 |
| 2015-11-06 | 102.61 | 103.03 | 103.07 | 103.26 | 103.3 |
| 2015-11-05 | 102.64 | 103 | 103.16 | 103.27 | 103.43 |
| 2015-11-04 | 102.44 | 102.78 | 102.74 | 103.05 | 103.01 |
| 2015-11-03 | 102.27 | 102.74 | 102.66 | 102.98 | 102.91 |
| 2015-11-02 | 102.3 | 102.78 | 102.65 | 102.98 | 102.85 |
| 2015-10-30 | 102.97 | 103.48 | 103.15 | 103.69 | 103.35 |
| 2015-10-29 | 102.4 | 102.88 | 102.81 | 103.08 | 103 |
| 2015-10-28 | 101.45 | 101.97 | 102.41 | 102.26 | 102.69 |
| 2015-10-27 | 101.37 | 101.85 | 102.22 | 102.09 | 102.47 |
| 2015-10-26 | 101.43 | 101.82 | 102.25 | 102.03 | 102.46 |
| 2015-10-23 | 101.14 | 101.46 | 101.74 | 101.73 | 102.01 |
| 2015-10-22 | 100.86 | 101.47 | 101.68 | 101.56 | 101.77 |
| 2015-10-21 | 100.99 | 101.53 | 101.66 | 101.66 | 101.8 |
| 2015-10-20 | 100.79 | 101.26 | 101.39 | 101.39 | 101.52 |
| 2015-10-19 | 100.71 | 101.02 | 100.99 | 101.24 | 101.2 |
| 2015-10-16 | 100.86 | 101.21 | 101.1 | 101.32 | 101.22 |
| 2015-10-15 | 100.68 | 101.17 | 100.95 | 101.23 | 101.02 |
| 2015-10-14 | 101.09 | 101.76 | 101.57 | 101.71 | 101.52 |
| 2015-10-13 | 101.37 | 101.97 | 101.76 | 101.89 | 101.68 |
| 2015-10-12 | 101.7 | 102.1 | 101.84 | 102.06 | 101.81 |
| 2015-10-09 | 101.43 | 101.98 | 101.73 | 101.81 | 101.56 |
| 2015-10-08 | 101.63 | 102.24 | 102.04 | 102.12 | 101.92 |
| 2015-10-07 | 102.07 | 102.65 | 102.1 | 102.51 | 101.97 |
| 2015-10-06 | 102.11 | 102.99 | 102.74 | 102.89 | 102.64 |
| 2015-10-05 | 101.99 | 102.96 | 102.78 | 102.79 | 102.61 |
| 2015-10-02 | 102.06 | 103.13 | 103.19 | 102.91 | 102.97 |
| 2015-10-01 | 102.22 | 103.22 | 103.07 | 103.04 | 102.9 |
| 2015-09-30 | 102.29 | 103.48 | 103.12 | 103.21 | 102.84 |
| 2015-09-29 | 102.39 | 103.69 | 103.15 | 103.32 | 102.79 |
| 2015-09-28 | 101.99 | 103.23 | 103.04 | 102.86 | 102.67 |
| 2015-09-25 | 101.69 | 102.9 | 103.03 | 102.54 | 102.68 |
| 2015-09-24 | 100.95 | 102.17 | 102.52 | 101.8 | 102.15 |
| 2015-09-23 | 101.1 | 102.2 | 102.81 | 101.87 | 102.49 |
| 2015-09-22 | 101.22 | 102.24 | 102.68 | 102.02 | 102.46 |
| 2015-09-21 | 101.14 | 102.18 | 102.5 | 101.97 | 102.3 |
| 2015-09-18 | 100.68 | 101.69 | 101.8 | 101.51 | 101.62 |
| 2015-09-17 | 100.73 | 101.76 | 102.22 | 101.61 | 102.07 |
| 2015-09-16 | 100.73 | 101.94 | 102.23 | 101.69 | 101.98 |
| 2015-09-15 | 100.99 | 102.32 | 102.61 | 102 | 102.28 |
| 2015-09-14 | 100.86 | 102.2 | 102.53 | 101.9 | 102.23 |
| 2015-09-11 | 101 | 102.32 | 102.68 | 102.03 | 102.39 |
| 2015-09-10 | 101.38 | 102.76 | 102.86 | 102.39 | 102.49 |
| 2015-09-09 | 100.51 | 101.77 | 102.93 | 101.47 | 102.63 |
| 2015-09-08 | 100.48 | 101.87 | 103.13 | 101.45 | 102.7 |
| 2015-09-07 | 100.49 | 101.81 | 103.3 | 101.38 | 102.86 |
| 2015-09-04 | 100.72 | 101.76 | 103.22 | 101.42 | 102.87 |
| 2015-09-03 | 100.92 | 101.93 | 103.15 | 101.6 | 102.82 |
| 2015-09-02 | 100.69 | 101.7 | 102.88 | 101.44 | 102.62 |
| 2015-09-01 | 100.79 | 101.61 | 102.35 | 101.41 | 102.15 |
| 2015-08-31 | 100.64 | 101.68 | 102.55 | 101.4 | 102.27 |
| 2015-08-28 | 100.24 | 101.15 | 102.06 | 100.94 | 101.85 |
| 2015-08-27 | 99.78 | 100.9 | 101.93 | 100.58 | 101.61 |
| 2015-08-26 | 99.17 | 100.53 | 101.57 | 100.17 | 101.2 |
| 2015-08-25 | 99.01 | 100.46 | 101.52 | 99.99 | 101.04 |
| 2015-08-24 | 98.74 | 100.38 | 101.38 | 99.84 | 100.84 |
| 2015-08-21 | 100.08 | 101.43 | 102.13 | 101 | 101.7 |
| 2015-08-20 | 100.46 | 101.55 | 102.24 | 101.24 | 101.92 |
| 2015-08-19 | 100.92 | 101.84 | 102.39 | 101.56 | 102.1 |
| 2015-08-18 | 101.03 | 101.92 | 102.43 | 101.64 | 102.15 |
| 2015-08-17 | 100.89 | 101.76 | 102.29 | 101.49 | 102.01 |
| 2015-08-14 | 100.64 | 101.37 | 102.09 | 101.17 | 101.88 |
| 2015-08-13 | 100.42 | 101.12 | 101.9 | 100.91 | 101.68 |
| 2015-08-12 | 99.63 | 100.5 | 102.04 | 100.1 | 101.64 |
| 2015-08-11 | 101.31 | 101.91 | 103.37 | 101.67 | 103.13 |
| 2015-08-10 | 104.57 | 105.05 | 104.92 | 104.95 | 104.82 |
| 2015-08-07 | 104.65 | 105.16 | 105.04 | 105.02 | 104.9 |
| 2015-08-06 | 104.79 | 105.24 | 105.15 | 105.13 | 105.04 |
| 2015-08-05 | 104.89 | 105.3 | 105.22 | 105.11 | 105.03 |
| 2015-08-04 | 104.4 | 104.82 | 104.71 | 104.66 | 104.55 |
| 2015-08-03 | 104.53 | 104.84 | 104.75 | 104.68 | 104.6 |
| 2015-07-31 | 104.18 | 104.53 | 104.44 | 104.28 | 104.19 |
| 2015-07-30 | 104.66 | 104.72 | 104.66 | 104.52 | 104.46 |
| 2015-07-29 | 104.22 | 104.26 | 104.18 | 104.12 | 104.04 |
| 2015-07-28 | 104.24 | 104.45 | 104.34 | 104.25 | 104.13 |
| 2015-07-27 | 103.96 | 104.14 | 104.12 | 103.88 | 103.87 |
| 2015-07-24 | 104.35 | 104.36 | 104.43 | 104.13 | 104.21 |
| 2015-07-23 | 104.41 | 104.36 | 104.21 | 104.14 | 103.99 |
| 2015-07-22 | 104.58 | 104.35 | 104.17 | 104.26 | 104.08 |
| 2015-07-21 | 104.44 | 104.28 | 104.02 | 104.11 | 103.86 |
| 2015-07-20 | 104.7 | 104.37 | 104.22 | 104.31 | 104.15 |
| 2015-07-17 | 104.65 | 104.3 | 104.12 | 104.27 | 104.09 |
| 2015-07-16 | 104.49 | 104.16 | 103.98 | 104.09 | 103.92 |
| 2015-07-15 | 104.36 | 103.97 | 103.83 | 103.95 | 103.81 |
| 2015-07-14 | 104.09 | 103.71 | 103.57 | 103.67 | 103.54 |
| 2015-07-13 | 104.08 | 103.59 | 103.52 | 103.69 | 103.62 |
| 2015-07-10 | 103.54 | 103.16 | 103.03 | 103.2 | 103.08 |
| 2015-07-09 | 103.66 | 103.31 | 103.22 | 103.32 | 103.24 |
| 2015-07-08 | 103.58 | 103.3 | 103.22 | 103.29 | 103.21 |
| 2015-07-07 | 103.94 | 103.48 | 103.52 | 103.59 | 103.63 |
| 2015-07-06 | 103.64 | 103.24 | 103.05 | 103.32 | 103.14 |
| 2015-07-03 | 103.69 | 103.16 | 102.93 | 103.27 | 103.04 |
| 2015-07-02 | 103.63 | 103.14 | 102.88 | 103.21 | 102.96 |
| 2015-07-01 | 103.58 | 102.98 | 102.8 | 103.13 | 102.95 |
| 2015-06-30 | 103.31 | 102.77 | 102.61 | 102.91 | 102.75 |
| 2015-06-29 | 103.33 | 102.82 | 102.59 | 102.86 | 102.63 |
| 2015-06-26 | 103.53 | 102.86 | 102.63 | 103.01 | 102.78 |
| 2015-06-25 | 103.26 | 102.61 | 102.31 | 102.8 | 102.49 |
| 2015-06-24 | 103.46 | 102.72 | 102.44 | 102.94 | 102.65 |
| 2015-06-23 | 103.35 | 102.58 | 102.26 | 102.82 | 102.5 |
| 2015-06-22 | 102.66 | 101.92 | 101.59 | 102.15 | 101.81 |
| 2015-06-19 | 102.67 | 102.05 | 101.78 | 102.2 | 101.93 |
| 2015-06-18 | 102.46 | 101.8 | 101.54 | 101.92 | 101.65 |
| 2015-06-17 | 103.34 | 102.65 | 102.38 | 102.75 | 102.48 |
| 2015-06-16 | 103.05 | 102.42 | 102.24 | 102.5 | 102.31 |
| 2015-06-15 | 103 | 102.42 | 102.26 | 102.51 | 102.36 |
| 2015-06-12 | 102.95 | 102.37 | 102.23 | 102.49 | 102.35 |
| 2015-06-11 | 103.18 | 102.46 | 102.31 | 102.66 | 102.5 |
| 2015-06-10 | 102.84 | 102.1 | 101.93 | 102.25 | 102.08 |
| 2015-06-09 | 103.4 | 102.74 | 102.62 | 102.86 | 102.74 |
| 2015-06-08 | 103.72 | 103.12 | 103 | 103.23 | 103.11 |
| 2015-06-05 | 103.98 | 103.19 | 103.1 | 103.46 | 103.37 |
| 2015-06-04 | 103.35 | 102.69 | 102.55 | 102.85 | 102.71 |
| 2015-06-03 | 103.26 | 102.46 | 102.26 | 102.68 | 102.48 |
| 2015-06-02 | 103.67 | 102.75 | 102.56 | 102.91 | 102.73 |
| 2015-06-01 | 104.44 | 103.27 | 103.12 | 103.54 | 103.39 |
| 2015-05-29 | 104.15 | 102.97 | 102.81 | 103.22 | 103.06 |
| 2015-05-28 | 104.27 | 103.02 | 102.86 | 103.31 | 103.15 |
| 2015-05-27 | 104.2 | 102.88 | 102.74 | 103.16 | 103.02 |
| 2015-05-26 | 103.96 | 102.54 | 102.36 | 102.83 | 102.65 |
| 2015-05-25 | 103.35 | 101.86 | 101.65 | 102.17 | 101.96 |
| 2015-05-22 | 103.35 | 101.86 | 101.65 | 102.17 | 101.96 |
| 2015-05-21 | 103.01 | 101.65 | 101.44 | 101.89 | 101.68 |
| 2015-05-20 | 102.96 | 101.64 | 101.44 | 101.87 | 101.67 |
| 2015-05-19 | 102.74 | 101.3 | 101.13 | 101.59 | 101.41 |
| 2015-05-18 | 101.89 | 100.58 | 100.39 | 100.79 | 100.6 |
| 2015-05-15 | 101.59 | 100.41 | 100.12 | 100.59 | 100.3 |
| 2015-05-14 | 101.66 | 100.56 | 100.37 | 100.71 | 100.52 |
| 2015-05-13 | 101.79 | 100.7 | 100.42 | 100.75 | 100.47 |
| 2015-05-12 | 102.26 | 101.07 | 100.84 | 101.24 | 101 |
| 2015-05-11 | 102.52 | 101.31 | 101.12 | 101.57 | 101.38 |
| 2015-05-08 | 102.4 | 101.13 | 100.9 | 101.4 | 101.16 |
| 2015-05-07 | 102.32 | 101.01 | 100.85 | 101.24 | 101.08 |
| 2015-05-06 | 102.01 | 100.67 | 100.46 | 100.95 | 100.75 |
| 2015-05-05 | 102.55 | 101.04 | 100.86 | 101.41 | 101.22 |
| 2015-05-04 | 102.71 | 101.24 | 101.05 | 101.63 | 101.45 |
| 2015-05-01 | 102.48 | 100.99 | 100.95 | 101.44 | 101.4 |
| 2015-04-30 | 102.37 | 100.92 | 100.82 | 101.35 | 101.25 |
| 2015-04-29 | 102.26 | 100.8 | 100.6 | 101.25 | 101.04 |
| 2015-04-28 | 102.67 | 101.15 | 100.9 | 101.63 | 101.37 |
| 2015-04-27 | 103.03 | 101.39 | 101.1 | 101.89 | 101.6 |
| 2015-04-24 | 103.49 | 101.82 | 101.63 | 102.26 | 102.06 |
| 2015-04-23 | 104.03 | 102.24 | 101.92 | 102.69 | 102.37 |
| 2015-04-22 | 104.24 | 102.51 | 102.25 | 103.03 | 102.77 |
| 2015-04-21 | 104.17 | 102.51 | 102.23 | 102.99 | 102.71 |
| 2015-04-20 | 104.1 | 102.34 | 102.07 | 102.85 | 102.58 |
| 2015-04-17 | 103.98 | 102.3 | 102.05 | 102.74 | 102.49 |
| 2015-04-16 | 104.33 | 102.46 | 102.18 | 102.86 | 102.58 |
| 2015-04-15 | 104.65 | 102.87 | 102.63 | 103.25 | 103.01 |
| 2015-04-14 | 104.21 | 102.54 | 102.34 | 102.93 | 102.73 |
| 2015-04-13 | 104.77 | 103.05 | 102.97 | 103.48 | 103.4 |
| 2015-04-10 | 104.52 | 102.78 | 102.7 | 103.23 | 103.15 |
| 2015-04-09 | 104.31 | 102.67 | 102.61 | 103.11 | 103.04 |
| 2015-04-08 | 104.05 | 102.55 | 102.42 | 102.97 | 102.84 |
| 2015-04-07 | 104.17 | 102.7 | 102.51 | 103.15 | 102.96 |
| 2015-04-06 | 103.57 | 102.24 | 101.98 | 102.66 | 102.4 |
| 2015-04-03 | 104.13 | 102.88 | 102.73 | 103.28 | 103.13 |
| 2015-04-02 | 104.13 | 102.88 | 102.73 | 103.28 | 103.13 |
| 2015-04-01 | 104.4 | 103.27 | 103.12 | 103.63 | 103.48 |
| 2015-03-31 | 104.47 | 103.42 | 103.28 | 103.72 | 103.58 |
| 2015-03-30 | 104.27 | 103.18 | 102.96 | 103.51 | 103.29 |
| 2015-03-27 | 103.72 | 102.69 | 102.4 | 102.98 | 102.69 |
| 2015-03-26 | 103.51 | 102.51 | 102.32 | 102.73 | 102.54 |
| 2015-03-25 | 103.41 | 102.41 | 102.15 | 102.7 | 102.44 |
| 2015-03-24 | 103.63 | 102.61 | 102.5 | 102.87 | 102.77 |
| 2015-03-23 | 103.68 | 102.93 | 102.53 | 103.1 | 102.7 |
| 2015-03-20 | 104.32 | 103.55 | 103.31 | 103.7 | 103.46 |
| 2015-03-19 | 104.99 | 103.99 | 104.04 | 104.29 | 104.34 |
| 2015-03-18 | 104.49 | 103.77 | 103.67 | 103.94 | 103.84 |
| 2015-03-17 | 104.48 | 103.77 | 103.51 | 103.98 | 103.72 |
| 2015-03-16 | 104.14 | 103.53 | 103.4 | 103.71 | 103.58 |
| 2015-03-13 | 104.07 | 103.3 | 103.47 | 103.52 | 103.7 |
| 2015-03-12 | 103.76 | 103.1 | 103.06 | 103.3 | 103.26 |
| 2015-03-11 | 104.06 | 103.37 | 103.38 | 103.61 | 103.62 |
| 2015-03-10 | 103.59 | 102.92 | 102.96 | 103.15 | 103.19 |
| 2015-03-09 | 103.15 | 102.34 | 102.28 | 102.61 | 102.55 |
| 2015-03-06 | 102.95 | 101.96 | 102.07 | 102.37 | 102.47 |
| 2015-03-05 | 102.4 | 101.61 | 101.53 | 101.92 | 101.84 |
| 2015-03-04 | 101.95 | 101.24 | 101.28 | 101.57 | 101.61 |
| 2015-03-03 | 101.62 | 100.98 | 100.94 | 101.29 | 101.25 |
| 2015-03-02 | 101.7 | 101.09 | 101.11 | 101.36 | 101.39 |
| 2015-02-27 | 101.49 | 100.83 | 100.88 | 101.1 | 101.15 |
| 2015-02-26 | 101.64 | 100.93 | 100.97 | 101.2 | 101.24 |
| 2015-02-25 | 101.22 | 100.79 | 100.73 | 101 | 100.94 |
| 2015-02-24 | 101.4 | 101.11 | 101.18 | 101.24 | 101.31 |
| 2015-02-23 | 101.33 | 101.04 | 101.13 | 101.18 | 101.27 |
| 2015-02-20 | 101.19 | 100.73 | 100.9 | 100.92 | 101.09 |
| 2015-02-19 | 101.3 | 100.86 | 100.93 | 101.06 | 101.12 |
| 2015-02-18 | 101.29 | 100.74 | 100.91 | 100.94 | 101.1 |
| 2015-02-17 | 101.2 | 100.74 | 100.88 | 100.93 | 101.07 |
| 2015-02-16 | 101.31 | 100.85 | 100.93 | 101.02 | 101.11 |
| 2015-02-13 | 101.73 | 101.22 | 101.02 | 101.46 | 101.26 |
| 2015-02-12 | 101.92 | 101.69 | 101.44 | 101.83 | 101.58 |
| 2015-02-11 | 102.21 | 101.81 | 101.69 | 102.13 | 102.02 |
| 2015-02-10 | 101.81 | 101.35 | 101.33 | 101.72 | 101.7 |
| 2015-02-09 | 101.69 | 101.25 | 101.09 | 101.54 | 101.38 |
| 2015-02-06 | 101.87 | 101.44 | 101.17 | 101.8 | 101.53 |
| 2015-02-05 | 101.37 | 101.09 | 100.75 | 101.39 | 101.05 |
| 2015-02-04 | 101.32 | 100.99 | 100.9 | 101.38 | 101.29 |
| 2015-02-03 | 101.28 | 101.06 | 100.89 | 101.32 | 101.14 |
| 2015-02-02 | 101.28 | 101.23 | 101.13 | 101.45 | 101.35 |
| 2015-01-30 | 101.22 | 101.12 | 101.43 | 101.48 | 101.79 |
| 2015-01-29 | 101.54 | 101.38 | 101.37 | 101.72 | 101.71 |
| 2015-01-28 | 101.26 | 100.91 | 100.88 | 101.3 | 101.27 |
| 2015-01-27 | 101.32 | 100.98 | 100.68 | 101.39 | 101.09 |
| 2015-01-26 | 101.6 | 101.1 | 100.89 | 101.54 | 101.34 |
| 2015-01-23 | 101.6 | 100.91 | 101.05 | 101.28 | 101.42 |
| 2015-01-22 | 101.52 | 101.06 | 100.95 | 101.37 | 101.25 |
| 2015-01-21 | 101.07 | 100.77 | 100.61 | 101.05 | 100.9 |
| 2015-01-20 | 101.1 | 100.83 | 100.7 | 101.08 | 100.95 |
| 2015-01-19 | 100.73 | 100.31 | 100.15 | 100.62 | 100.46 |
| 2015-01-16 | 100.82 | 100.3 | 100.53 | 100.64 | 100.87 |
| 2015-01-15 | 101.07 | 100.82 | 100.78 | 101.08 | 101.04 |
| 2015-01-14 | 100.86 | 101.06 | 100.81 | 101.36 | 101.11 |
| 2015-01-13 | 101.06 | 101.22 | 100.98 | 101.53 | 101.28 |
| 2015-01-12 | 100.97 | 100.92 | 100.63 | 101.22 | 100.92 |
| 2015-01-09 | 100.79 | 100.73 | 100.48 | 100.92 | 100.66 |
| 2015-01-08 | 100.95 | 100.8 | 100.63 | 100.93 | 100.77 |
| 2015-01-07 | 101.01 | 101.03 | 100.89 | 101.15 | 101.02 |
| 2015-01-06 | 100.61 | 100.66 | 100.4 | 100.74 | 100.47 |
| 2015-01-05 | 100.44 | 100.44 | 100.33 | 100.39 | 100.28 |
| 2015-01-02 | 100.19 | 100.11 | 100.27 | 100.1 | 100.26 |
| 2015-01-01 | 100 | 100 | 100 | 100 | 100 |
| 2014-12-31 | 100 | 100 | 100 | 100 | 100 |
| 2014-12-30 | 99.72 | 99.5 | 99.58 | 99.44 | 99.52 |
| 2014-12-29 | 99.7 | 99.54 | 99.51 | 99.53 | 99.5 |
| 2014-12-26 | 100.05 | 99.67 | 99.49 | 99.62 | 99.44 |
| 2014-12-25 | 99.85 | 99.53 | 99.46 | 99.44 | 99.37 |
| 2014-12-24 | 99.85 | 99.53 | 99.46 | 99.44 | 99.37 |
| 2014-12-23 | 99.83 | 99.56 | 99.41 | 99.48 | 99.33 |
| 2014-12-22 | 99.66 | 99.45 | 99.18 | 99.42 | 99.15 |
| 2014-12-19 | 99.51 | 99.57 | 99.36 | 99.49 | 99.28 |
| 2014-12-18 | 99.42 | 99.64 | 99.45 | 99.56 | 99.38 |
| 2014-12-17 | 99.24 | 99.58 | 99.39 | 99.54 | 99.35 |
| 2014-12-16 | 98.97 | 99.89 | 99.73 | 99.98 | 99.81 |
| 2014-12-15 | 99.36 | 99.76 | 99.65 | 99.69 | 99.57 |
| 2014-12-12 | 99.29 | 99.41 | 99.3 | 99.24 | 99.12 |
| 2014-12-11 | 99.59 | 99.51 | 99.35 | 99.37 | 99.21 |
| 2014-12-10 | 99.57 | 99.49 | 99.31 | 99.31 | 99.12 |
| 2014-12-09 | 99.42 | 99.35 | 99.17 | 99.1 | 98.93 |
| 2014-12-08 | 100.26 | 100.17 | 99.96 | 99.88 | 99.67 |
| 2014-12-05 | 100.59 | 100.35 | 100.22 | 100.09 | 99.96 |
| 2014-12-04 | 99.96 | 99.96 | 99.7 | 99.62 | 99.37 |
| 2014-12-03 | 100.2 | 100.05 | 99.81 | 99.75 | 99.51 |
| 2014-12-02 | 99.83 | 99.73 | 99.59 | 99.47 | 99.33 |
| 2014-12-01 | 99.44 | 99.34 | 99.24 | 98.96 | 98.86 |
| 2014-11-28 | 99.46 | 99.08 | 99.09 | 98.73 | 98.74 |
| 2014-11-27 | 99.46 | 98.86 | 98.75 | 98.58 | 98.46 |
| 2014-11-26 | 99.29 | 98.73 | 98.65 | 98.34 | 98.25 |
| 2014-11-25 | 99.51 | 98.83 | 98.75 | 98.41 | 98.32 |
| 2014-11-24 | 99.34 | 98.61 | 98.71 | 98.16 | 98.26 |
| 2014-11-21 | 99.6 | 99.02 | 98.95 | 98.55 | 98.48 |
| 2014-11-20 | 99.64 | 99.14 | 98.95 | 98.65 | 98.46 |
| 2014-11-19 | 99.64 | 99.05 | 98.95 | 98.65 | 98.55 |
| 2014-11-18 | 99.46 | 98.89 | 98.63 | 98.54 | 98.28 |
| 2014-11-17 | 99.5 | 98.87 | 98.68 | 98.59 | 98.4 |
| 2014-11-14 | 99.38 | 98.83 | 98.6 | 98.47 | 98.25 |
| 2014-11-13 | 99.2 | 98.63 | 98.48 | 98.3 | 98.15 |
| 2014-11-12 | 99.09 | 98.45 | 98.28 | 98.1 | 97.93 |
| 2014-11-11 | 99.36 | 98.69 | 98.55 | 98.43 | 98.29 |
| 2014-11-10 | 99.29 | 98.48 | 98.32 | 98.26 | 98.1 |
| 2014-11-07 | 99.21 | 98.58 | 98.6 | 98.3 | 98.31 |
| 2014-11-06 | 99.42 | 98.67 | 98.59 | 98.47 | 98.4 |
| 2014-11-05 | 99.29 | 98.4 | 98.28 | 98.18 | 98.06 |
| 2014-11-04 | 98.79 | 97.85 | 97.71 | 97.63 | 97.49 |
| 2014-11-03 | 98.94 | 97.87 | 97.84 | 97.72 | 97.7 |
| 2014-10-31 | 98.5 | 97.4 | 97.39 | 97.23 | 97.23 |
| 2014-10-30 | 97.93 | 96.69 | 96.51 | 96.58 | 96.4 |
| 2014-10-29 | 97.46 | 96.34 | 96.16 | 96.27 | 96.09 |
| 2014-10-28 | 97.56 | 96.41 | 96.19 | 96.32 | 96.09 |
| 2014-10-27 | 97.52 | 96.36 | 96.22 | 96.24 | 96.11 |
| 2014-10-24 | 97.65 | 96.47 | 96.37 | 96.32 | 96.22 |
| 2014-10-23 | 97.69 | 96.45 | 96.35 | 96.32 | 96.22 |
| 2014-10-22 | 97.46 | 96.17 | 96.08 | 96.05 | 95.96 |
| 2014-10-21 | 97.22 | 95.97 | 95.86 | 95.79 | 95.68 |
| 2014-10-20 | 97.08 | 95.92 | 95.88 | 95.69 | 95.65 |
| 2014-10-17 | 97.06 | 95.89 | 95.92 | 95.6 | 95.63 |
| 2014-10-16 | 96.89 | 95.74 | 95.86 | 95.48 | 95.61 |
| 2014-10-15 | 97.08 | 95.95 | 95.86 | 95.68 | 95.59 |
| 2014-10-14 | 97.36 | 96.14 | 96.17 | 95.89 | 95.92 |
| 2014-10-13 | 97.34 | 96.15 | 96.11 | 95.86 | 95.81 |
| 2014-10-10 | 97.47 | 96.25 | 96.22 | 95.95 | 95.92 |
| 2014-10-09 | 97.19 | 96.04 | 95.96 | 95.67 | 95.59 |
| 2014-10-08 | 97.4 | 96.24 | 96.08 | 95.89 | 95.74 |
| 2014-10-07 | 97.36 | 96.09 | 96 | 95.83 | 95.74 |
| 2014-10-06 | 97.65 | 96.32 | 96.29 | 96.07 | 96.04 |
| 2014-10-03 | 97.69 | 96.21 | 96.44 | 96.07 | 96.29 |
| 2014-10-02 | 97.1 | 95.75 | 95.88 | 95.53 | 95.65 |
| 2014-10-01 | 97.24 | 95.87 | 96.19 | 95.67 | 95.99 |
| 2014-09-30 | 97.08 | 95.65 | 96.03 | 95.53 | 95.9 |
| 2014-09-29 | 96.96 | 95.51 | 95.72 | 95.38 | 95.59 |
| 2014-09-26 | 97.35 | 95.75 | 95.83 | 95.71 | 95.78 |
| 2014-09-25 | 97.06 | 95.44 | 95.38 | 95.37 | 95.31 |
| 2014-09-24 | 97.02 | 95.35 | 95.21 | 95.29 | 95.15 |
| 2014-09-23 | 96.89 | 95.26 | 95.13 | 95.19 | 95.06 |
| 2014-09-22 | 96.81 | 95.17 | 95.17 | 95.11 | 95.1 |
| 2014-09-19 | 96.82 | 95.23 | 95.08 | 95.11 | 94.96 |
| 2014-09-18 | 96.54 | 94.98 | 94.85 | 94.84 | 94.71 |
| 2014-09-17 | 96.16 | 94.55 | 94.52 | 94.47 | 94.44 |
| 2014-09-16 | 96.02 | 94.49 | 94.51 | 94.4 | 94.42 |
| 2014-09-15 | 95.94 | 94.39 | 94.59 | 94.29 | 94.48 |
| 2014-09-12 | 96.39 | 94.71 | 94.58 | 94.63 | 94.49 |
| 2014-09-11 | 96.31 | 94.61 | 94.49 | 94.49 | 94.37 |
| 2014-09-10 | 96.35 | 94.5 | 94.35 | 94.51 | 94.36 |
| 2014-09-09 | 96.17 | 94.31 | 94.11 | 94.3 | 94.09 |
| 2014-09-08 | 95.86 | 94.05 | 93.75 | 94 | 93.7 |
| 2014-09-05 | 95.54 | 93.8 | 93.61 | 93.73 | 93.54 |
| 2014-09-04 | 95.53 | 93.7 | 93.58 | 93.69 | 93.57 |
| 2014-09-03 | 95.17 | 93.42 | 93.28 | 93.36 | 93.22 |
| 2014-09-02 | 95.15 | 93.41 | 93.29 | 93.39 | 93.27 |
| 2014-09-01 | 95.02 | 93.22 | 93.05 | 93.21 | 93.05 |
| 2014-08-29 | 94.83 | 93.04 | 92.92 | 93.01 | 92.89 |
| 2014-08-28 | 94.79 | 92.96 | 92.86 | 92.92 | 92.81 |
| 2014-08-27 | 94.85 | 92.98 | 92.81 | 92.93 | 92.76 |
| 2014-08-26 | 94.84 | 93 | 92.75 | 92.93 | 92.68 |
| 2014-08-25 | 94.76 | 92.95 | 92.77 | 92.85 | 92.67 |
| 2014-08-22 | 94.66 | 92.84 | 92.74 | 92.76 | 92.66 |
| 2014-08-21 | 94.61 | 92.88 | 92.71 | 92.72 | 92.55 |
| 2014-08-20 | 94.7 | 92.96 | 92.78 | 92.8 | 92.63 |
| 2014-08-19 | 94.54 | 92.74 | 92.57 | 92.62 | 92.45 |
| 2014-08-18 | 94.43 | 92.65 | 92.4 | 92.51 | 92.25 |
| 2014-08-15 | 94.32 | 92.57 | 92.36 | 92.39 | 92.18 |
| 2014-08-14 | 94.25 | 92.53 | 92.29 | 92.35 | 92.11 |
| 2014-08-13 | 94.17 | 92.56 | 92.4 | 92.29 | 92.14 |
| 2014-08-12 | 94.14 | 92.5 | 92.35 | 92.27 | 92.13 |
| 2014-08-11 | 94.22 | 92.61 | 92.41 | 92.34 | 92.13 |
| 2014-08-08 | 94.12 | 92.62 | 92.39 | 92.28 | 92.05 |
| 2014-08-07 | 94.09 | 92.6 | 92.46 | 92.26 | 92.12 |
| 2014-08-06 | 94.07 | 92.55 | 92.36 | 92.25 | 92.06 |
| 2014-08-05 | 94.03 | 92.41 | 92.19 | 92.17 | 91.95 |
| 2014-08-04 | 93.78 | 92.26 | 92 | 91.95 | 91.69 |
| 2014-08-01 | 93.68 | 92.2 | 92.02 | 91.85 | 91.67 |
| 2014-07-31 | 93.89 | 92.25 | 92.09 | 92 | 91.85 |
| 2014-07-30 | 93.84 | 92.15 | 92.03 | 91.94 | 91.82 |
| 2014-07-29 | 93.56 | 91.9 | 91.68 | 91.66 | 91.44 |
| 2014-07-28 | 93.38 | 91.75 | 91.49 | 91.47 | 91.21 |
| 2014-07-25 | 93.28 | 91.6 | 91.38 | 91.32 | 91.1 |
| 2014-07-24 | 93.18 | 91.53 | 91.28 | 91.22 | 90.97 |
| 2014-07-23 | 93.07 | 91.36 | 91.09 | 91.08 | 90.81 |
| 2014-07-22 | 92.98 | 91.28 | 91.06 | 91 | 90.78 |
| 2014-07-21 | 92.84 | 91.2 | 90.96 | 90.89 | 90.65 |
| 2014-07-18 | 92.86 | 91.26 | 91.04 | 90.93 | 90.71 |
| 2014-07-17 | 92.9 | 91.28 | 91.08 | 90.94 | 90.75 |
| 2014-07-16 | 92.84 | 91.2 | 91.05 | 90.83 | 90.68 |
| 2014-07-15 | 92.7 | 91 | 90.9 | 90.68 | 90.58 |
| 2014-07-14 | 92.64 | 90.87 | 90.71 | 90.62 | 90.46 |
| 2014-07-11 | 92.73 | 90.95 | 90.75 | 90.7 | 90.49 |
| 2014-07-10 | 92.7 | 90.82 | 90.66 | 90.62 | 90.46 |
| 2014-07-09 | 92.77 | 90.89 | 90.67 | 90.7 | 90.48 |
| 2014-07-08 | 92.75 | 90.89 | 90.71 | 90.71 | 90.53 |
| 2014-07-07 | 92.85 | 90.98 | 90.8 | 90.83 | 90.65 |
| 2014-07-04 | 92.86 | 90.98 | 90.81 | 90.85 | 90.68 |
| 2014-07-03 | 92.77 | 90.86 | 90.66 | 90.74 | 90.53 |
| 2014-07-02 | 92.54 | 90.7 | 90.56 | 90.55 | 90.4 |
| 2014-07-01 | 92.58 | 90.8 | 90.63 | 90.61 | 90.45 |
| 2014-06-30 | 92.54 | 90.72 | 90.55 | 90.52 | 90.35 |
| 2014-06-27 | 92.55 | 90.68 | 90.46 | 90.48 | 90.26 |
| 2014-06-26 | 92.56 | 90.7 | 90.5 | 90.49 | 90.28 |
| 2014-06-25 | 92.49 | 90.71 | 90.41 | 90.45 | 90.15 |
| 2014-06-24 | 92.53 | 90.7 | 90.51 | 90.47 | 90.28 |
| 2014-06-23 | 92.58 | 90.82 | 90.59 | 90.6 | 90.36 |
| 2014-06-20 | 92.64 | 90.92 | 90.74 | 90.68 | 90.51 |
| 2014-06-19 | 92.46 | 90.73 | 90.5 | 90.5 | 90.27 |
| 2014-06-18 | 92.67 | 90.99 | 90.77 | 90.75 | 90.53 |
| 2014-06-17 | 92.72 | 91.01 | 90.88 | 90.79 | 90.66 |
| 2014-06-16 | 92.7 | 91.01 | 90.75 | 90.78 | 90.52 |
| 2014-06-13 | 92.97 | 91.2 | 91 | 91.01 | 90.8 |
| 2014-06-12 | 92.82 | 91.06 | 90.79 | 90.85 | 90.59 |
| 2014-06-11 | 92.78 | 91 | 90.73 | 90.83 | 90.56 |
| 2014-06-10 | 92.93 | 91.15 | 90.85 | 90.97 | 90.67 |
| 2014-06-09 | 92.73 | 90.94 | 90.57 | 90.76 | 90.39 |
| 2014-06-06 | 92.45 | 90.74 | 90.46 | 90.52 | 90.23 |
| 2014-06-05 | 92.33 | 90.64 | 90.5 | 90.43 | 90.3 |
| 2014-06-04 | 92.43 | 90.8 | 90.68 | 90.57 | 90.46 |
| 2014-06-03 | 92.5 | 90.84 | 90.6 | 90.61 | 90.37 |
| 2014-06-02 | 92.41 | 90.76 | 90.68 | 90.52 | 90.44 |
| 2014-05-30 | 92.33 | 90.65 | 90.45 | 90.43 | 90.23 |
| 2014-05-29 | 92.37 | 90.65 | 90.58 | 90.42 | 90.35 |
| 2014-05-28 | 92.27 | 90.51 | 90.45 | 90.29 | 90.23 |
| 2014-05-27 | 92.39 | 90.64 | 90.53 | 90.4 | 90.28 |
| 2014-05-26 | 92.53 | 90.78 | 90.54 | 90.51 | 90.27 |
| 2014-05-23 | 92.6 | 90.86 | 90.61 | 90.58 | 90.34 |
| 2014-05-22 | 92.55 | 90.81 | 90.58 | 90.54 | 90.3 |
| 2014-05-21 | 92.51 | 90.82 | 90.63 | 90.52 | 90.32 |
| 2014-05-20 | 92.35 | 90.69 | 90.48 | 90.39 | 90.18 |
| 2014-05-19 | 92.21 | 90.55 | 90.33 | 90.27 | 90.05 |
| 2014-05-16 | 92.3 | 90.71 | 90.52 | 90.42 | 90.23 |
| 2014-05-15 | 92.38 | 90.76 | 90.57 | 90.46 | 90.27 |
| 2014-05-14 | 92.44 | 90.86 | 90.64 | 90.54 | 90.31 |
| 2014-05-13 | 92.32 | 90.73 | 90.69 | 90.48 | 90.44 |
| 2014-05-12 | 92.21 | 90.69 | 90.53 | 90.41 | 90.25 |
| 2014-05-09 | 92.26 | 90.76 | 90.63 | 90.47 | 90.34 |
| 2014-05-08 | 92.03 | 90.54 | 90.38 | 90.24 | 90.08 |
| 2014-05-07 | 91.96 | 90.46 | 90.25 | 90.15 | 89.95 |
| 2014-05-06 | 92.04 | 90.67 | 90.45 | 90.29 | 90.06 |
| 2014-05-05 | 92.06 | 90.68 | 90.43 | 90.33 | 90.09 |
| 2014-05-02 | 91.93 | 90.55 | 90.3 | 90.21 | 89.96 |
| 2014-05-01 | 91.98 | 90.62 | 90.3 | 90.25 | 89.93 |
| 2014-04-30 | 91.95 | 90.57 | 90.31 | 90.2 | 89.93 |
| 2014-04-29 | 92.04 | 90.61 | 90.4 | 90.28 | 90.07 |
| 2014-04-28 | 92.08 | 90.72 | 90.55 | 90.34 | 90.17 |
| 2014-04-25 | 91.92 | 90.66 | 90.55 | 90.22 | 90.1 |
| 2014-04-24 | 92.11 | 90.77 | 90.63 | 90.36 | 90.22 |
| 2014-04-23 | 92.24 | 90.92 | 90.79 | 90.49 | 90.37 |
| 2014-04-22 | 92.31 | 90.99 | 90.79 | 90.59 | 90.39 |
| 2014-04-21 | 92.43 | 91.12 | 90.92 | 90.7 | 90.5 |
| 2014-04-18 | 92.43 | 91.11 | 90.92 | 90.68 | 90.49 |
| 2014-04-17 | 92.43 | 91.11 | 90.92 | 90.68 | 90.49 |
| 2014-04-16 | 92.36 | 91.09 | 90.96 | 90.68 | 90.55 |
| 2014-04-15 | 92.31 | 91.04 | 90.89 | 90.58 | 90.44 |
| 2014-04-14 | 92.34 | 91.06 | 90.9 | 90.62 | 90.46 |
| 2014-04-11 | 92.36 | 91.03 | 90.8 | 90.61 | 90.38 |
| 2014-04-10 | 92.4 | 91.08 | 90.77 | 90.6 | 90.29 |
| 2014-04-09 | 92.72 | 91.41 | 91.15 | 90.94 | 90.68 |
| 2014-04-08 | 92.9 | 91.67 | 91.43 | 91.1 | 90.87 |
| 2014-04-07 | 93.01 | 91.78 | 91.58 | 91.23 | 91.03 |
| 2014-04-04 | 93.07 | 91.8 | 91.66 | 91.28 | 91.14 |
| 2014-04-03 | 93.19 | 91.96 | 91.82 | 91.41 | 91.26 |
| 2014-04-02 | 93.21 | 91.95 | 91.73 | 91.39 | 91.17 |
| 2014-04-01 | 93.12 | 91.86 | 91.62 | 91.27 | 91.02 |
| 2014-03-31 | 92.87 | 91.71 | 91.44 | 91.05 | 90.78 |
| 2014-03-28 | 93.1 | 92.03 | 91.72 | 91.33 | 91.02 |
| 2014-03-27 | 93 | 91.94 | 91.66 | 91.21 | 90.94 |
| 2014-03-26 | 93.12 | 92.08 | 91.76 | 91.32 | 91.01 |
| 2014-03-25 | 93.44 | 92.42 | 92.01 | 91.63 | 91.22 |
| 2014-03-24 | 93.56 | 92.54 | 92.23 | 91.76 | 91.46 |
| 2014-03-21 | 93.44 | 92.43 | 91.78 | 91.64 | 91 |
| 2014-03-20 | 93.34 | 92.24 | 91.73 | 91.49 | 90.99 |
| 2014-03-19 | 93.2 | 92.09 | 91.68 | 91.35 | 90.94 |
| 2014-03-18 | 93.18 | 92.1 | 91.71 | 91.37 | 90.97 |
| 2014-03-17 | 93.46 | 92.36 | 91.93 | 91.65 | 91.22 |
| 2014-03-14 | 93.64 | 92.62 | 92.47 | 91.85 | 91.71 |
| 2014-03-13 | 93.94 | 92.85 | 92.68 | 92.13 | 91.96 |
| 2014-03-12 | 94.17 | 93.09 | 92.79 | 92.38 | 92.09 |
| 2014-03-11 | 94.22 | 93.07 | 92.85 | 92.42 | 92.21 |
| 2014-03-10 | 94.29 | 93.15 | 92.9 | 92.49 | 92.24 |
| 2014-03-07 | 94.61 | 93.4 | 92.97 | 92.79 | 92.36 |
| 2014-03-06 | 94.77 | 93.57 | 93.07 | 92.91 | 92.41 |
| 2014-03-05 | 94.55 | 93.34 | 93.11 | 92.63 | 92.41 |
| 2014-03-04 | 94.57 | 93.4 | 92.95 | 92.67 | 92.22 |
| 2014-03-03 | 94.46 | 93.31 | 92.78 | 92.61 | 92.08 |
| 2014-02-28 | 94.56 | 93.36 | 92.72 | 92.68 | 92.04 |
| 2014-02-27 | 94.97 | 93.8 | 93.21 | 93.12 | 92.55 |
| 2014-02-26 | 94.79 | 93.54 | 93.25 | 92.9 | 92.62 |
| 2014-02-25 | 94.58 | 93.45 | 93.12 | 92.72 | 92.39 |
| 2014-02-24 | 94.98 | 93.82 | 93.61 | 93.07 | 92.87 |
| 2014-02-21 | 95.08 | 93.9 | 93.76 | 93.19 | 93.05 |
| 2014-02-20 | 95.41 | 94.26 | 93.88 | 93.54 | 93.17 |
| 2014-02-19 | 95.61 | 94.43 | 93.78 | 93.76 | 93.11 |
| 2014-02-18 | 95.82 | 94.6 | 93.91 | 93.92 | 93.24 |
| 2014-02-17 | 95.85 | 94.51 | 93.85 | 93.88 | 93.23 |
| 2014-02-14 | 95.91 | 94.62 | 93.9 | 93.97 | 93.26 |
| 2014-02-13 | 96 | 94.71 | 94.13 | 94.05 | 93.48 |
| 2014-02-12 | 96.18 | 94.8 | 94.21 | 94.19 | 93.61 |
| 2014-02-11 | 96.08 | 94.83 | 94.23 | 94.12 | 93.53 |
| 2014-02-10 | 96.22 | 94.92 | 94.34 | 94.22 | 93.65 |
| 2014-02-07 | 96.39 | 95.12 | 94.35 | 94.39 | 93.63 |
| 2014-02-06 | 96.42 | 95.18 | 94.43 | 94.4 | 93.65 |
| 2014-02-05 | 96.45 | 95.18 | 94.47 | 94.42 | 93.71 |
| 2014-02-04 | 96.55 | 95.37 | 94.65 | 94.56 | 93.85 |
| 2014-02-03 | 96.57 | 95.37 | 94.73 | 94.56 | 93.93 |
| 2014-01-31 | 96.75 | 95.35 | 94.79 | 94.72 | 94.16 |
| 2014-01-30 | 96.65 | 95.3 | 94.72 | 94.66 | 94.08 |
| 2014-01-29 | 96.52 | 95.17 | 94.6 | 94.51 | 93.94 |
| 2014-01-28 | 96.55 | 95.29 | 94.77 | 94.52 | 94 |
| 2014-01-27 | 96.39 | 95.14 | 94.79 | 94.33 | 93.98 |
| 2014-01-24 | 96.42 | 95.06 | 94.72 | 94.28 | 93.94 |
| 2014-01-23 | 96.6 | 95.18 | 94.69 | 94.48 | 93.99 |
| 2014-01-22 | 96.89 | 95.34 | 94.79 | 94.73 | 94.18 |
| 2014-01-21 | 96.97 | 95.35 | 94.85 | 94.77 | 94.27 |
| 2014-01-20 | 97.08 | 95.44 | 94.71 | 94.86 | 94.14 |
| 2014-01-17 | 97.07 | 95.33 | 94.7 | 94.79 | 94.16 |
| 2014-01-16 | 96.96 | 95.26 | 94.55 | 94.67 | 93.97 |
| 2014-01-15 | 96.92 | 95.25 | 94.66 | 94.66 | 94.08 |
| 2014-01-14 | 96.53 | 94.89 | 94.32 | 94.29 | 93.72 |
| 2014-01-13 | 96.35 | 94.71 | 94.26 | 94.14 | 93.69 |
| 2014-01-10 | 96.42 | 94.79 | 94.29 | 94.19 | 93.69 |
| 2014-01-09 | 96.67 | 94.99 | 94.55 | 94.41 | 93.97 |
| 2014-01-08 | 96.64 | 94.98 | 94.57 | 94.37 | 93.96 |
| 2014-01-07 | 96.63 | 95 | 94.6 | 94.35 | 93.95 |
| 2014-01-06 | 96.38 | 94.78 | 94.44 | 94.15 | 93.81 |
| 2014-01-03 | 96.33 | 94.6 | 94.33 | 94.07 | 93.8 |
| 2014-01-02 | 96.33 | 94.53 | 94.33 | 94.06 | 93.86 |
| 2014-01-01 | 95.92 | 94.2 | 94.08 | 93.65 | 93.52 |
| 2013-12-31 | 95.92 | 94.2 | 94.08 | 93.65 | 93.52 |
| 2013-12-30 | 95.83 | 94.09 | 93.96 | 93.54 | 93.41 |
| 2013-12-27 | 95.8 | 94.02 | 93.87 | 93.48 | 93.33 |
| 2013-12-26 | 95.92 | 94.14 | 93.95 | 93.57 | 93.37 |
| 2013-12-25 | 95.9 | 94.12 | 93.93 | 93.53 | 93.35 |
| 2013-12-24 | 95.9 | 94.12 | 93.93 | 93.53 | 93.35 |
| 2013-12-23 | 95.83 | 94.07 | 93.85 | 93.46 | 93.24 |
| 2013-12-20 | 95.93 | 94.2 | 93.96 | 93.59 | 93.36 |
| 2013-12-19 | 95.94 | 94.14 | 93.98 | 93.55 | 93.4 |
| 2013-12-18 | 95.55 | 93.69 | 93.51 | 93.15 | 92.97 |
| 2013-12-17 | 95.56 | 93.67 | 93.49 | 93.12 | 92.94 |
| 2013-12-16 | 95.47 | 93.63 | 93.41 | 93.07 | 92.85 |
| 2013-12-13 | 95.5 | 93.65 | 93.48 | 93.08 | 92.92 |
| 2013-12-12 | 95.43 | 93.55 | 93.41 | 93 | 92.86 |
| 2013-12-11 | 95.13 | 93.33 | 93.17 | 92.74 | 92.58 |
| 2013-12-10 | 95.25 | 93.49 | 93.19 | 92.9 | 92.6 |
| 2013-12-09 | 95.43 | 93.66 | 93.33 | 93.08 | 92.75 |
| 2013-12-06 | 95.39 | 93.7 | 93.28 | 93.07 | 92.65 |
| 2013-12-05 | 95.27 | 93.56 | 93.17 | 92.92 | 92.53 |
| 2013-12-04 | 95.51 | 93.79 | 93.44 | 93.17 | 92.82 |
| 2013-12-03 | 95.25 | 93.6 | 93.26 | 92.95 | 92.61 |
| 2013-12-02 | 95.4 | 93.65 | 93.34 | 93.06 | 92.76 |
| 2013-11-29 | 95.18 | 93.48 | 93.15 | 92.85 | 92.52 |
| 2013-11-28 | 95.25 | 93.56 | 93.25 | 92.91 | 92.6 |
| 2013-11-27 | 95.28 | 93.59 | 93.29 | 92.95 | 92.64 |
| 2013-11-26 | 95.27 | 93.51 | 93.11 | 92.85 | 92.46 |
| 2013-11-25 | 95.37 | 93.63 | 93.24 | 92.97 | 92.58 |
| 2013-11-22 | 95.34 | 93.57 | 93.07 | 92.91 | 92.41 |
| 2013-11-21 | 95.38 | 93.66 | 93.12 | 92.97 | 92.44 |
| 2013-11-20 | 95.11 | 93.36 | 92.74 | 92.69 | 92.07 |
| 2013-11-19 | 95.09 | 93.31 | 92.65 | 92.64 | 91.99 |
| 2013-11-18 | 95.01 | 93.21 | 92.66 | 92.52 | 91.97 |
| 2013-11-15 | 95.07 | 93.34 | 92.88 | 92.62 | 92.16 |
| 2013-11-14 | 95.05 | 93.35 | 92.94 | 92.59 | 92.18 |
| 2013-11-13 | 95.12 | 93.44 | 93.03 | 92.64 | 92.23 |
| 2013-11-12 | 95.12 | 93.44 | 93.02 | 92.64 | 92.23 |
| 2013-11-11 | 95.04 | 93.37 | 92.98 | 92.56 | 92.17 |
| 2013-11-08 | 95.07 | 93.27 | 92.9 | 92.53 | 92.16 |
| 2013-11-07 | 94.79 | 92.96 | 92.71 | 92.24 | 91.99 |
| 2013-11-06 | 94.45 | 92.71 | 92.35 | 91.95 | 91.59 |
| 2013-11-05 | 94.5 | 92.73 | 92.38 | 91.98 | 91.64 |
| 2013-11-04 | 94.48 | 92.71 | 92.31 | 91.94 | 91.54 |
| 2013-11-01 | 94.58 | 92.76 | 92.39 | 92.02 | 91.65 |
| 2013-10-31 | 94.22 | 92.41 | 92.1 | 91.63 | 91.32 |
| 2013-10-30 | 93.97 | 92.22 | 91.83 | 91.41 | 91.02 |
| 2013-10-29 | 94.01 | 92.25 | 91.89 | 91.44 | 91.08 |
| 2013-10-28 | 93.92 | 92.17 | 91.81 | 91.33 | 90.97 |
| 2013-10-25 | 93.79 | 92.09 | 91.77 | 91.24 | 90.92 |
| 2013-10-24 | 93.77 | 92.05 | 91.77 | 91.2 | 90.93 |
| 2013-10-23 | 93.68 | 91.91 | 91.71 | 91.11 | 90.91 |
| 2013-10-22 | 93.7 | 92.01 | 91.66 | 91.17 | 90.82 |
| 2013-10-21 | 93.9 | 92.16 | 91.88 | 91.33 | 91.05 |
| 2013-10-18 | 93.73 | 91.98 | 91.68 | 91.15 | 90.85 |
| 2013-10-17 | 93.83 | 92.07 | 91.76 | 91.22 | 90.91 |
| 2013-10-16 | 94.4 | 92.62 | 92.35 | 91.83 | 91.56 |
| 2013-10-15 | 94.3 | 92.57 | 92.28 | 91.76 | 91.47 |
| 2013-10-14 | 94.06 | 92.38 | 92.09 | 91.5 | 91.21 |
| 2013-10-11 | 94.11 | 92.4 | 91.98 | 91.53 | 91.12 |
| 2013-10-10 | 94.19 | 92.49 | 92.13 | 91.6 | 91.25 |
| 2013-10-09 | 93.99 | 92.3 | 91.98 | 91.41 | 91.09 |
| 2013-10-08 | 93.79 | 92.11 | 91.74 | 91.19 | 90.83 |
| 2013-10-07 | 93.89 | 92.16 | 91.77 | 91.27 | 90.89 |
| 2013-10-04 | 93.86 | 92.13 | 91.7 | 91.25 | 90.82 |
| 2013-10-03 | 93.88 | 92.16 | 91.75 | 91.24 | 90.83 |
| 2013-10-02 | 93.88 | 92.21 | 91.86 | 91.3 | 90.95 |
| 2013-10-01 | 94.09 | 92.37 | 92.06 | 91.49 | 91.18 |
| 2013-09-30 | 94.1 | 92.41 | 92.13 | 91.53 | 91.25 |
| 2013-09-27 | 94.17 | 92.41 | 92.15 | 91.54 | 91.29 |
| 2013-09-26 | 94.32 | 92.57 | 92.32 | 91.7 | 91.46 |
| 2013-09-25 | 94.23 | 92.52 | 92.26 | 91.62 | 91.37 |
| 2013-09-24 | 94.24 | 92.44 | 92.18 | 91.59 | 91.34 |
| 2013-09-23 | 94.22 | 92.45 | 92.12 | 91.57 | 91.25 |
| 2013-09-20 | 94.42 | 92.67 | 92.3 | 91.7 | 91.34 |
| 2013-09-19 | 94.23 | 92.51 | 92.12 | 91.52 | 91.14 |
| 2013-09-18 | 94.72 | 93.08 | 92.71 | 92.16 | 91.8 |
| 2013-09-17 | 94.81 | 93.18 | 92.8 | 92.27 | 91.89 |
| 2013-09-16 | 94.76 | 93.16 | 92.76 | 92.27 | 91.87 |
| 2013-09-13 | 95.14 | 93.51 | 93.2 | 92.61 | 92.3 |
| 2013-09-12 | 95.01 | 93.38 | 93.04 | 92.48 | 92.15 |
| 2013-09-11 | 95.13 | 93.57 | 93.21 | 92.68 | 92.33 |
| 2013-09-10 | 95.27 | 93.72 | 93.36 | 92.88 | 92.52 |
| 2013-09-09 | 95.32 | 93.76 | 93.36 | 92.89 | 92.49 |
| 2013-09-06 | 95.4 | 93.94 | 93.61 | 93.02 | 92.69 |
| 2013-09-05 | 95.74 | 94.27 | 93.97 | 93.34 | 93.04 |
| 2013-09-04 | 95.43 | 93.94 | 93.62 | 93.01 | 92.7 |
| 2013-09-03 | 95.69 | 94.18 | 93.87 | 93.24 | 92.94 |
| 2013-09-02 | 95.6 | 94.07 | 93.79 | 93.09 | 92.82 |
| 2013-08-30 | 95.53 | 94.04 | 93.78 | 92.95 | 92.7 |
| 2013-08-29 | 95.44 | 94 | 93.75 | 92.92 | 92.68 |
| 2013-08-28 | 95.16 | 93.78 | 93.52 | 92.61 | 92.36 |
| 2013-08-27 | 95.05 | 93.64 | 93.33 | 92.44 | 92.14 |
| 2013-08-26 | 95.17 | 93.75 | 93.4 | 92.6 | 92.25 |
| 2013-08-23 | 95.11 | 93.73 | 93.4 | 92.53 | 92.2 |
| 2013-08-22 | 95.24 | 93.9 | 93.62 | 92.66 | 92.38 |
| 2013-08-21 | 94.98 | 93.55 | 93.25 | 92.33 | 92.03 |
| 2013-08-20 | 94.8 | 93.4 | 93.01 | 92.12 | 91.74 |
| 2013-08-19 | 94.92 | 93.46 | 93.16 | 92.25 | 91.95 |
| 2013-08-16 | 94.92 | 93.47 | 93.17 | 92.27 | 91.97 |
| 2013-08-15 | 95.24 | 93.76 | 93.53 | 92.54 | 92.31 |
| 2013-08-14 | 95.06 | 93.66 | 93.4 | 92.44 | 92.18 |
| 2013-08-13 | 95.14 | 93.67 | 93.43 | 92.5 | 92.25 |
| 2013-08-12 | 94.65 | 93.19 | 92.94 | 91.98 | 91.73 |
| 2013-08-09 | 94.46 | 93.02 | 92.74 | 91.8 | 91.52 |
| 2013-08-08 | 94.52 | 93.06 | 92.71 | 91.82 | 91.48 |
| 2013-08-07 | 94.88 | 93.4 | 93.17 | 92.16 | 91.92 |
| 2013-08-06 | 95.05 | 93.51 | 93.28 | 92.32 | 92.09 |
| 2013-08-05 | 95.38 | 93.77 | 93.52 | 92.63 | 92.38 |
| 2013-08-02 | 95.25 | 93.76 | 93.54 | 92.52 | 92.3 |
| 2013-08-01 | 95.39 | 93.86 | 93.68 | 92.64 | 92.46 |
| 2013-07-31 | 95.1 | 93.57 | 93.44 | 92.32 | 92.2 |
| 2013-07-30 | 94.94 | 93.33 | 93.19 | 92.17 | 92.03 |
| 2013-07-29 | 94.74 | 93.18 | 93 | 92.02 | 91.85 |
| 2013-07-26 | 94.69 | 93.14 | 92.98 | 91.97 | 91.82 |
| 2013-07-25 | 94.98 | 93.43 | 93.26 | 92.25 | 92.09 |
| 2013-07-24 | 95.08 | 93.46 | 93.23 | 92.32 | 92.09 |
| 2013-07-23 | 94.98 | 93.41 | 93.18 | 92.22 | 91.98 |
| 2013-07-22 | 94.93 | 93.43 | 93.13 | 92.22 | 91.93 |
| 2013-07-19 | 95.27 | 93.77 | 93.53 | 92.57 | 92.33 |
| 2013-07-18 | 95.39 | 93.91 | 93.68 | 92.68 | 92.46 |
| 2013-07-17 | 95.24 | 93.75 | 93.55 | 92.55 | 92.35 |
| 2013-07-16 | 95.08 | 93.58 | 93.37 | 92.39 | 92.19 |
| 2013-07-15 | 95.45 | 93.92 | 93.74 | 92.74 | 92.56 |
| 2013-07-12 | 95.38 | 93.86 | 93.68 | 92.64 | 92.47 |
| 2013-07-11 | 95.27 | 93.74 | 93.53 | 92.53 | 92.33 |
| 2013-07-10 | 95.9 | 94.49 | 94.33 | 93.22 | 93.07 |
| 2013-07-09 | 96.26 | 94.88 | 94.8 | 93.59 | 93.52 |
| 2013-07-08 | 96.14 | 94.94 | 94.77 | 93.54 | 93.38 |
| 2013-07-05 | 96.32 | 94.93 | 94.72 | 93.63 | 93.42 |
| 2013-07-04 | 95.85 | 94.51 | 94.36 | 93.19 | 93.05 |
| 2013-07-03 | 95.74 | 94.41 | 94.22 | 93.04 | 92.85 |
| 2013-07-02 | 95.64 | 94.25 | 94.01 | 92.96 | 92.73 |
| 2013-07-01 | 95.41 | 94.04 | 93.83 | 92.74 | 92.53 |
| 2013-06-28 | 95.49 | 94.14 | 93.88 | 92.76 | 92.51 |
| 2013-06-27 | 95.05 | 93.85 | 93.59 | 92.37 | 92.12 |
| 2013-06-26 | 94.84 | 93.69 | 93.5 | 92.16 | 91.97 |
| 2013-06-25 | 94.89 | 93.78 | 93.5 | 92.18 | 91.91 |
| 2013-06-24 | 94.91 | 93.8 | 93.53 | 92.19 | 91.92 |
| 2013-06-21 | 95.03 | 93.78 | 93.53 | 92.24 | 92 |
| 2013-06-20 | 95.01 | 93.69 | 93.56 | 92.21 | 92.09 |
| 2013-06-19 | 93.73 | 92.36 | 92.11 | 90.87 | 90.63 |
| 2013-06-18 | 93.8 | 92.35 | 92.26 | 90.89 | 90.8 |
| 2013-06-17 | 93.68 | 92.2 | 92.04 | 90.75 | 90.6 |
| 2013-06-14 | 93.54 | 92.05 | 91.85 | 90.59 | 90.39 |
| 2013-06-13 | 93.46 | 92.11 | 91.98 | 90.59 | 90.46 |
| 2013-06-12 | 93.64 | 92.32 | 92.25 | 90.83 | 90.76 |
| 2013-06-11 | 94.01 | 92.66 | 92.67 | 91.23 | 91.23 |
| 2013-06-10 | 94.47 | 93.02 | 93.04 | 91.7 | 91.72 |
| 2013-06-07 | 94.16 | 92.65 | 92.5 | 91.37 | 91.22 |
| 2013-06-06 | 94.4 | 92.9 | 92.62 | 91.65 | 91.38 |
| 2013-06-05 | 94.83 | 93.3 | 93.08 | 92.09 | 91.87 |
| 2013-06-04 | 94.92 | 93.44 | 93.23 | 92.18 | 91.97 |
| 2013-06-03 | 94.83 | 93.43 | 93.2 | 92.11 | 91.88 |
| 2013-05-31 | 95.1 | 93.58 | 93.6 | 92.29 | 92.31 |
| 2013-05-30 | 95 | 93.46 | 93.32 | 92.16 | 92.02 |
| 2013-05-29 | 95.38 | 93.81 | 93.65 | 92.48 | 92.32 |
| 2013-05-28 | 96.01 | 94.28 | 94.03 | 93.05 | 92.8 |
| 2013-05-27 | 95.61 | 93.84 | 93.55 | 92.6 | 92.31 |
| 2013-05-24 | 95.5 | 93.79 | 93.46 | 92.5 | 92.18 |
| 2013-05-23 | 95.5 | 93.82 | 93.54 | 92.53 | 92.26 |
| 2013-05-22 | 95.92 | 94.07 | 93.78 | 92.97 | 92.68 |
| 2013-05-21 | 95.5 | 93.66 | 93.44 | 92.56 | 92.34 |
| 2013-05-20 | 95.42 | 93.68 | 93.41 | 92.51 | 92.25 |
| 2013-05-17 | 95.47 | 93.73 | 93.56 | 92.59 | 92.42 |
| 2013-05-16 | 94.97 | 93.26 | 92.98 | 92.07 | 91.8 |
| 2013-05-15 | 95.08 | 93.4 | 93.17 | 92.24 | 92.02 |
| 2013-05-14 | 94.83 | 93.07 | 92.81 | 91.95 | 91.7 |
| 2013-05-13 | 94.62 | 92.96 | 92.71 | 91.79 | 91.54 |
| 2013-05-10 | 94.55 | 92.86 | 92.73 | 91.74 | 91.61 |
| 2013-05-09 | 93.83 | 92.02 | 91.94 | 90.96 | 90.87 |
| 2013-05-08 | 93.63 | 91.77 | 91.49 | 90.72 | 90.45 |
| 2013-05-07 | 93.58 | 91.74 | 91.61 | 90.68 | 90.54 |
| 2013-05-06 | 93.3 | 91.54 | 91.48 | 90.45 | 90.4 |
| 2013-05-03 | 93.45 | 91.79 | 91.55 | 90.65 | 90.42 |
| 2013-05-02 | 93.38 | 91.73 | 91.58 | 90.55 | 90.41 |
| 2013-05-01 | 93 | 91.39 | 91.12 | 90.18 | 89.92 |
| 2013-04-30 | 92.89 | 91.28 | 91.05 | 90.06 | 89.83 |
| 2013-04-29 | 93.22 | 91.63 | 91.38 | 90.38 | 90.14 |
| 2013-04-26 | 93.28 | 91.73 | 91.56 | 90.46 | 90.29 |
| 2013-04-25 | 93.58 | 92.02 | 91.76 | 90.78 | 90.52 |
| 2013-04-24 | 93.63 | 92.11 | 91.83 | 90.83 | 90.55 |
| 2013-04-23 | 93.48 | 92.02 | 91.81 | 90.71 | 90.5 |
| 2013-04-22 | 93.4 | 91.9 | 91.68 | 90.6 | 90.39 |
| 2013-04-19 | 93.35 | 91.84 | 91.56 | 90.54 | 90.27 |
| 2013-04-18 | 93.16 | 91.72 | 91.43 | 90.34 | 90.05 |
| 2013-04-17 | 93.06 | 91.57 | 91.51 | 90.23 | 90.17 |
| 2013-04-16 | 92.81 | 91.32 | 91.16 | 90 | 89.84 |
| 2013-04-15 | 92.86 | 91.42 | 91.23 | 90.06 | 89.87 |
| 2013-04-12 | 92.87 | 91.51 | 91.22 | 90.06 | 89.78 |
| 2013-04-11 | 92.91 | 91.55 | 91.16 | 90.1 | 89.72 |
| 2013-04-10 | 92.97 | 91.65 | 91.35 | 90.16 | 89.85 |
| 2013-04-09 | 92.96 | 91.68 | 91.31 | 90.15 | 89.79 |
| 2013-04-08 | 93.01 | 91.76 | 91.47 | 90.25 | 89.97 |
| 2013-04-05 | 92.73 | 91.42 | 91.19 | 89.97 | 89.74 |
| 2013-04-04 | 92.9 | 91.49 | 91.31 | 90.13 | 89.95 |
| 2013-04-03 | 92.44 | 90.96 | 90.65 | 89.59 | 89.28 |
| 2013-04-02 | 92.56 | 91.07 | 90.8 | 89.7 | 89.44 |
| 2013-04-01 | 92.44 | 90.88 | 90.6 | 89.54 | 89.27 |
| 2013-03-29 | 92.48 | 90.91 | 90.6 | 89.61 | 89.31 |
| 2013-03-28 | 92.48 | 90.91 | 90.6 | 89.61 | 89.31 |
| 2013-03-27 | 92.62 | 91.02 | 90.78 | 89.75 | 89.51 |
| 2013-03-26 | 92.48 | 90.85 | 90.55 | 89.61 | 89.32 |
| 2013-03-25 | 92.52 | 90.91 | 90.62 | 89.63 | 89.34 |
| 2013-03-22 | 92.4 | 90.88 | 90.54 | 89.5 | 89.16 |
| 2013-03-21 | 92.59 | 91.04 | 90.7 | 89.72 | 89.39 |
| 2013-03-20 | 92.67 | 91.09 | 90.81 | 89.77 | 89.5 |
| 2013-03-19 | 92.66 | 91.03 | 90.75 | 89.77 | 89.48 |
| 2013-03-18 | 92.53 | 90.99 | 90.67 | 89.68 | 89.36 |
| 2013-03-15 | 92.37 | 90.78 | 90.47 | 89.49 | 89.18 |
| 2013-03-14 | 92.63 | 91.05 | 90.78 | 89.81 | 89.55 |
| 2013-03-13 | 92.82 | 91.07 | 90.79 | 89.96 | 89.68 |
| 2013-03-12 | 92.7 | 90.95 | 90.6 | 89.84 | 89.49 |
| 2013-03-11 | 92.81 | 91.04 | 90.64 | 89.94 | 89.55 |
| 2013-03-08 | 92.94 | 91.12 | 90.73 | 90.08 | 89.69 |
| 2013-03-07 | 92.42 | 90.6 | 90.17 | 89.53 | 89.11 |
| 2013-03-06 | 92.36 | 90.45 | 90.11 | 89.42 | 89.08 |
| 2013-03-05 | 92.18 | 90.3 | 90.03 | 89.22 | 88.96 |
| 2013-03-04 | 92.15 | 90.32 | 90.11 | 89.2 | 88.98 |
| 2013-03-01 | 92.17 | 90.29 | 90.04 | 89.26 | 89.02 |
| 2013-02-28 | 91.76 | 89.88 | 89.67 | 88.8 | 88.6 |
| 2013-02-27 | 91.62 | 89.75 | 89.48 | 88.64 | 88.38 |
| 2013-02-26 | 91.64 | 89.8 | 89.57 | 88.67 | 88.45 |
| 2013-02-25 | 91.6 | 89.79 | 89.54 | 88.69 | 88.44 |
| 2013-02-22 | 91.47 | 89.67 | 89.46 | 88.57 | 88.37 |
| 2013-02-21 | 91.3 | 89.49 | 89.29 | 88.37 | 88.17 |
| 2013-02-20 | 91.18 | 89.29 | 89.06 | 88.22 | 88 |
| 2013-02-19 | 91.05 | 89.22 | 88.95 | 88.12 | 87.85 |
| 2013-02-18 | 91.29 | 89.44 | 89.07 | 88.34 | 87.97 |
| 2013-02-15 | 91.42 | 89.53 | 89.12 | 88.46 | 88.06 |
| 2013-02-14 | 91.22 | 89.38 | 89.02 | 88.24 | 87.88 |
| 2013-02-13 | 91.17 | 89.36 | 88.98 | 88.18 | 87.81 |
| 2013-02-12 | 91.06 | 89.28 | 88.93 | 88.06 | 87.71 |
| 2013-02-11 | 91.3 | 89.56 | 89.2 | 88.31 | 87.96 |
| 2013-02-08 | 91.08 | 89.37 | 89.01 | 88.09 | 87.74 |
| 2013-02-07 | 91.16 | 89.35 | 89.03 | 88.16 | 87.84 |
| 2013-02-06 | 91.07 | 89.28 | 88.85 | 88.06 | 87.65 |
| 2013-02-05 | 91.03 | 89.22 | 88.82 | 88.01 | 87.61 |
| 2013-02-04 | 90.82 | 89.01 | 88.58 | 87.8 | 87.38 |
| 2013-02-01 | 90.67 | 88.99 | 88.58 | 87.64 | 87.24 |
| 2013-01-31 | 90.64 | 88.89 | 88.57 | 87.62 | 87.3 |
| 2013-01-30 | 90.56 | 88.78 | 88.48 | 87.54 | 87.24 |
| 2013-01-29 | 90.52 | 88.72 | 88.47 | 87.51 | 87.26 |
| 2013-01-28 | 90.47 | 88.72 | 88.66 | 87.42 | 87.36 |
| 2013-01-25 | 90.68 | 88.76 | 88.47 | 87.64 | 87.34 |
| 2013-01-24 | 90.76 | 88.79 | 88.39 | 87.71 | 87.31 |
| 2013-01-23 | 90.63 | 88.64 | 88.22 | 87.57 | 87.15 |
| 2013-01-22 | 90.69 | 88.65 | 88.14 | 87.61 | 87.1 |
| 2013-01-21 | 90.92 | 88.89 | 88.31 | 87.86 | 87.29 |
| 2013-01-18 | 91.05 | 88.94 | 88.38 | 87.97 | 87.42 |
| 2013-01-17 | 90.85 | 88.79 | 88.14 | 87.79 | 87.14 |
| 2013-01-16 | 90.73 | 88.67 | 88.08 | 87.66 | 87.07 |
| 2013-01-15 | 90.61 | 88.53 | 88.03 | 87.53 | 87.04 |
| 2013-01-14 | 90.75 | 88.69 | 88.04 | 87.7 | 87.05 |
| 2013-01-11 | 90.79 | 88.73 | 88.07 | 87.75 | 87.1 |
| 2013-01-10 | 90.82 | 88.8 | 88.05 | 87.77 | 87.03 |
| 2013-01-09 | 90.94 | 88.89 | 88.33 | 87.89 | 87.33 |
| 2013-01-08 | 90.75 | 88.68 | 88.23 | 87.65 | 87.21 |
| 2013-01-07 | 90.73 | 88.69 | 88.21 | 87.66 | 87.18 |
| 2013-01-04 | 90.83 | 88.8 | 88.37 | 87.79 | 87.36 |
| 2013-01-03 | 90.47 | 88.44 | 87.95 | 87.4 | 86.92 |
| 2013-01-02 | 90.33 | 88.34 | 87.78 | 87.27 | 86.71 |
| 2013-01-01 | 90.16 | 88.29 | 88 | 87.17 | 86.88 |
| 2012-12-31 | 90.16 | 88.29 | 88 | 87.17 | 86.88 |
| 2012-12-28 | 90.08 | 88.19 | 87.85 | 87.05 | 86.71 |
| 2012-12-27 | 89.99 | 88.1 | 87.81 | 86.95 | 86.66 |
| 2012-12-26 | 89.93 | 88.09 | 87.82 | 86.92 | 86.66 |
| 2012-12-25 | 89.91 | 88.06 | 87.73 | 86.87 | 86.54 |
| 2012-12-24 | 89.91 | 88.06 | 87.73 | 86.87 | 86.54 |
| 2012-12-21 | 89.8 | 87.98 | 87.7 | 86.78 | 86.5 |
| 2012-12-20 | 89.78 | 87.98 | 87.56 | 86.76 | 86.35 |
| 2012-12-19 | 89.83 | 88.03 | 87.48 | 86.81 | 86.27 |
| 2012-12-18 | 89.78 | 87.98 | 87.45 | 86.77 | 86.24 |
| 2012-12-17 | 89.76 | 87.95 | 87.48 | 86.75 | 86.29 |
| 2012-12-14 | 89.76 | 87.93 | 87.44 | 86.71 | 86.23 |
| 2012-12-13 | 89.83 | 87.97 | 87.58 | 86.77 | 86.38 |
| 2012-12-12 | 89.73 | 87.86 | 87.28 | 86.64 | 86.07 |
| 2012-12-11 | 89.74 | 87.88 | 87.4 | 86.65 | 86.17 |
| 2012-12-10 | 90.07 | 88.22 | 87.55 | 86.97 | 86.31 |
| 2012-12-07 | 90.1 | 88.28 | 87.8 | 87.01 | 86.54 |
| 2012-12-06 | 89.96 | 88.17 | 87.73 | 86.88 | 86.44 |
| 2012-12-05 | 89.82 | 88.02 | 87.64 | 86.73 | 86.35 |
| 2012-12-04 | 89.73 | 87.97 | 87.53 | 86.65 | 86.21 |
| 2012-12-03 | 89.82 | 88.03 | 87.64 | 86.73 | 86.34 |
| 2012-11-30 | 89.98 | 88.17 | 87.79 | 86.88 | 86.51 |
| 2012-11-29 | 90.01 | 88.2 | 87.76 | 86.9 | 86.47 |
| 2012-11-28 | 89.91 | 88.14 | 87.9 | 86.83 | 86.59 |
| 2012-11-27 | 89.94 | 88.15 | 87.96 | 86.86 | 86.68 |
| 2012-11-26 | 89.82 | 88.06 | 87.86 | 86.75 | 86.56 |
| 2012-11-23 | 89.87 | 88.12 | 87.89 | 86.81 | 86.59 |
| 2012-11-22 | 90.06 | 88.28 | 88.09 | 87 | 86.82 |
| 2012-11-21 | 90.17 | 88.34 | 88.15 | 87.09 | 86.91 |
| 2012-11-20 | 90.02 | 88.19 | 88.02 | 86.95 | 86.78 |
| 2012-11-19 | 89.89 | 88.13 | 87.91 | 86.83 | 86.61 |
| 2012-11-16 | 90.12 | 88.39 | 88.28 | 87.08 | 86.97 |
| 2012-11-15 | 90.07 | 88.31 | 88.03 | 87.02 | 86.75 |
| 2012-11-14 | 90.2 | 88.43 | 88.06 | 87.15 | 86.78 |
| 2012-11-13 | 89.99 | 88.26 | 87.93 | 86.91 | 86.59 |
| 2012-11-12 | 89.91 | 88.15 | 87.88 | 86.81 | 86.55 |
| 2012-11-09 | 89.83 | 88.04 | 87.67 | 86.72 | 86.36 |
| 2012-11-08 | 89.76 | 88.02 | 87.72 | 86.68 | 86.39 |
| 2012-11-07 | 89.72 | 87.92 | 87.61 | 86.61 | 86.3 |
| 2012-11-06 | 89.67 | 87.94 | 87.64 | 86.59 | 86.3 |
| 2012-11-05 | 89.69 | 87.96 | 87.72 | 86.62 | 86.38 |
| 2012-11-02 | 89.61 | 87.88 | 87.68 | 86.52 | 86.33 |
| 2012-11-01 | 89.31 | 87.62 | 87.44 | 86.22 | 86.05 |
| 2012-10-31 | 89.28 | 87.56 | 87.42 | 86.17 | 86.04 |
| 2012-10-30 | 89.16 | 87.46 | 87.31 | 86.06 | 85.91 |
| 2012-10-29 | 89.36 | 87.69 | 87.52 | 86.26 | 86.1 |
| 2012-10-26 | 89.27 | 87.59 | 87.31 | 86.14 | 85.86 |
| 2012-10-25 | 89.39 | 87.73 | 87.46 | 86.27 | 86.01 |
| 2012-10-24 | 89.27 | 87.64 | 87.41 | 86.13 | 85.9 |
| 2012-10-23 | 89.24 | 87.57 | 87.47 | 86.08 | 85.97 |
| 2012-10-22 | 89 | 87.36 | 87.13 | 85.83 | 85.6 |
| 2012-10-19 | 88.93 | 87.25 | 87.07 | 85.72 | 85.55 |
| 2012-10-18 | 88.75 | 87.07 | 86.92 | 85.51 | 85.36 |
| 2012-10-17 | 88.61 | 86.95 | 86.74 | 85.36 | 85.15 |
| 2012-10-16 | 88.81 | 87.14 | 86.92 | 85.57 | 85.35 |
| 2012-10-15 | 88.93 | 87.26 | 87 | 85.67 | 85.42 |
| 2012-10-12 | 88.73 | 87.07 | 86.91 | 85.46 | 85.31 |
| 2012-10-11 | 88.69 | 87.03 | 86.88 | 85.41 | 85.26 |
| 2012-10-10 | 88.63 | 86.97 | 86.87 | 85.35 | 85.26 |
| 2012-10-09 | 88.64 | 86.92 | 86.78 | 85.34 | 85.2 |
| 2012-10-08 | 88.5 | 86.79 | 86.67 | 85.18 | 85.06 |
| 2012-10-05 | 88.32 | 86.61 | 86.55 | 85 | 84.94 |
| 2012-10-04 | 88.25 | 86.57 | 86.65 | 84.95 | 85.03 |
| 2012-10-03 | 88.48 | 86.78 | 86.89 | 85.19 | 85.3 |
| 2012-10-02 | 88.3 | 86.63 | 86.66 | 85.01 | 85.05 |
| 2012-10-01 | 88.24 | 86.59 | 86.66 | 84.99 | 85.06 |
| 2012-09-28 | 88.26 | 86.64 | 86.68 | 85.04 | 85.09 |
| 2012-09-27 | 88.1 | 86.55 | 86.49 | 84.91 | 84.85 |
| 2012-09-26 | 88.36 | 86.83 | 86.68 | 85.16 | 85.01 |
| 2012-09-25 | 87.91 | 86.41 | 86.28 | 84.72 | 84.59 |
| 2012-09-24 | 87.99 | 86.49 | 86.38 | 84.8 | 84.7 |
| 2012-09-21 | 87.86 | 86.36 | 86.27 | 84.67 | 84.58 |
| 2012-09-20 | 87.96 | 86.52 | 86.49 | 84.81 | 84.79 |
| 2012-09-19 | 87.69 | 86.18 | 86.12 | 84.53 | 84.47 |
| 2012-09-18 | 87.63 | 86.14 | 86.09 | 84.47 | 84.41 |
| 2012-09-17 | 87.55 | 86.01 | 85.91 | 84.34 | 84.23 |
| 2012-09-14 | 87.46 | 85.96 | 85.79 | 84.25 | 84.09 |
| 2012-09-13 | 87.69 | 86.27 | 86.13 | 84.51 | 84.38 |
| 2012-09-12 | 87.82 | 86.39 | 86.27 | 84.67 | 84.55 |
| 2012-09-11 | 87.81 | 86.41 | 86.26 | 84.69 | 84.54 |
| 2012-09-10 | 88.05 | 86.64 | 86.51 | 84.93 | 84.8 |
| 2012-09-07 | 88 | 86.62 | 86.4 | 84.89 | 84.68 |
| 2012-09-06 | 88.5 | 87.1 | 86.97 | 85.41 | 85.28 |
| 2012-09-05 | 88.53 | 87.11 | 86.94 | 85.41 | 85.24 |
| 2012-09-04 | 88.62 | 87.16 | 86.97 | 85.48 | 85.3 |
| 2012-09-03 | 88.55 | 87.09 | 86.99 | 85.43 | 85.33 |
| 2012-08-31 | 88.39 | 87.03 | 86.87 | 85.32 | 85.18 |
| 2012-08-30 | 88.67 | 87.27 | 87.14 | 85.61 | 85.48 |
| 2012-08-29 | 88.58 | 87.15 | 87.02 | 85.49 | 85.36 |
| 2012-08-28 | 88.41 | 86.99 | 86.89 | 85.28 | 85.18 |
| 2012-08-27 | 88.48 | 87.03 | 86.91 | 85.35 | 85.23 |
| 2012-08-24 | 88.49 | 87.04 | 86.9 | 85.36 | 85.23 |
| 2012-08-23 | 88.23 | 86.8 | 86.65 | 85.12 | 84.98 |
| 2012-08-22 | 88.66 | 87.29 | 87.18 | 85.62 | 85.51 |
| 2012-08-21 | 88.62 | 87.23 | 87.04 | 85.6 | 85.41 |
| 2012-08-20 | 88.88 | 87.51 | 87.35 | 85.87 | 85.71 |
| 2012-08-17 | 88.99 | 87.59 | 87.46 | 85.98 | 85.85 |
| 2012-08-16 | 88.63 | 87.27 | 87.14 | 85.64 | 85.51 |
| 2012-08-15 | 88.7 | 87.28 | 87.2 | 85.7 | 85.62 |
| 2012-08-14 | 88.66 | 87.23 | 87.16 | 85.63 | 85.56 |
| 2012-08-13 | 88.52 | 87.14 | 86.99 | 85.51 | 85.36 |
| 2012-08-10 | 88.5 | 87.11 | 87.01 | 85.49 | 85.39 |
| 2012-08-09 | 88.61 | 87.17 | 87.05 | 85.6 | 85.49 |
| 2012-08-08 | 88.39 | 86.98 | 86.91 | 85.37 | 85.3 |
| 2012-08-07 | 88.32 | 86.93 | 86.79 | 85.31 | 85.18 |
| 2012-08-06 | 88.14 | 86.77 | 86.63 | 85.15 | 85.01 |
| 2012-08-03 | 88.38 | 87.1 | 86.97 | 85.45 | 85.33 |
| 2012-08-02 | 88.71 | 87.33 | 87.34 | 85.75 | 85.76 |
| 2012-08-01 | 88.44 | 87.06 | 86.99 | 85.49 | 85.42 |
| 2012-07-31 | 88.41 | 87.07 | 87.04 | 85.46 | 85.42 |
| 2012-07-30 | 88.47 | 87.2 | 87.06 | 85.55 | 85.41 |
| 2012-07-27 | 88.37 | 87.12 | 86.95 | 85.45 | 85.28 |
| 2012-07-26 | 88.53 | 87.35 | 87.1 | 85.61 | 85.37 |
| 2012-07-25 | 88.97 | 87.75 | 87.54 | 86.03 | 85.83 |
| 2012-07-24 | 89.04 | 87.78 | 87.6 | 86.11 | 85.94 |
| 2012-07-23 | 89.04 | 87.77 | 87.57 | 86.1 | 85.9 |
| 2012-07-20 | 89 | 87.66 | 87.46 | 86 | 85.81 |
| 2012-07-19 | 88.77 | 87.46 | 87.26 | 85.8 | 85.6 |
| 2012-07-18 | 88.95 | 87.65 | 87.48 | 85.98 | 85.81 |
| 2012-07-17 | 89.14 | 87.79 | 87.65 | 86.13 | 85.99 |
| 2012-07-16 | 89.02 | 87.73 | 87.53 | 86.03 | 85.83 |
| 2012-07-13 | 89.19 | 87.94 | 87.66 | 86.22 | 85.95 |
| 2012-07-12 | 89.47 | 88.17 | 88 | 86.47 | 86.31 |
| 2012-07-11 | 89.33 | 88.04 | 87.8 | 86.42 | 86.18 |
| 2012-07-10 | 89.38 | 88.08 | 87.86 | 86.42 | 86.21 |
| 2012-07-09 | 89.29 | 87.97 | 87.76 | 86.34 | 86.13 |
| 2012-07-06 | 89.29 | 87.89 | 87.74 | 86.29 | 86.14 |
| 2012-07-05 | 89.29 | 87.91 | 87.68 | 86.3 | 86.09 |
| 2012-07-04 | 89.15 | 87.74 | 87.54 | 86.1 | 85.9 |
| 2012-07-03 | 88.87 | 87.51 | 87.31 | 85.83 | 85.64 |
| 2012-07-02 | 88.92 | 87.63 | 87.47 | 85.89 | 85.72 |
| 2012-06-29 | 88.7 | 87.47 | 87.32 | 85.72 | 85.57 |
| 2012-06-28 | 89.35 | 88.08 | 87.96 | 86.32 | 86.21 |
| 2012-06-27 | 89.27 | 88.06 | 87.98 | 86.28 | 86.2 |
| 2012-06-26 | 89.22 | 87.98 | 87.83 | 86.17 | 86.03 |
| 2012-06-25 | 89.22 | 88.01 | 87.95 | 86.18 | 86.12 |
| 2012-06-22 | 89.16 | 87.99 | 87.9 | 86.21 | 86.12 |
| 2012-06-21 | 88.95 | 87.73 | 87.59 | 85.97 | 85.83 |
| 2012-06-20 | 88.62 | 87.37 | 87.18 | 85.55 | 85.37 |
| 2012-06-19 | 88.6 | 87.37 | 87.26 | 85.51 | 85.4 |
| 2012-06-18 | 88.83 | 87.53 | 87.45 | 85.69 | 85.6 |
| 2012-06-15 | 88.62 | 87.4 | 87.33 | 85.47 | 85.41 |
| 2012-06-14 | 89 | 87.75 | 87.54 | 85.85 | 85.64 |
| 2012-06-13 | 89.05 | 87.82 | 87.59 | 85.9 | 85.68 |
| 2012-06-12 | 89.36 | 88.12 | 87.93 | 86.22 | 86.03 |
| 2012-06-11 | 89.2 | 87.91 | 87.75 | 86.03 | 85.87 |
| 2012-06-08 | 89.39 | 88.17 | 88 | 86.23 | 86.06 |
| 2012-06-07 | 89.19 | 87.95 | 87.73 | 86 | 85.78 |
| 2012-06-06 | 89.26 | 88.08 | 87.91 | 86.07 | 85.9 |
| 2012-06-05 | 89.46 | 88.25 | 88.04 | 86.25 | 86.05 |
| 2012-06-04 | 89.37 | 88.21 | 88.04 | 86.2 | 86.03 |
| 2012-06-01 | 89.64 | 88.37 | 88.2 | 86.42 | 86.26 |
| 2012-05-31 | 89.58 | 88.34 | 88.17 | 86.36 | 86.19 |
| 2012-05-30 | 89.72 | 88.41 | 88.23 | 86.46 | 86.28 |
| 2012-05-29 | 89.48 | 88.23 | 88.02 | 86.26 | 86.04 |
| 2012-05-28 | 89.57 | 88.38 | 88.13 | 86.3 | 86.06 |
| 2012-05-25 | 89.7 | 88.48 | 88.28 | 86.42 | 86.23 |
| 2012-05-24 | 89.6 | 88.34 | 88.03 | 86.3 | 86 |
| 2012-05-23 | 89.68 | 88.28 | 88.08 | 86.31 | 86.11 |
| 2012-05-22 | 89.36 | 87.95 | 87.77 | 86.02 | 85.84 |
| 2012-05-21 | 89.29 | 87.91 | 87.68 | 85.91 | 85.69 |
| 2012-05-18 | 89.36 | 87.99 | 87.76 | 85.97 | 85.75 |
| 2012-05-17 | 89.29 | 87.88 | 87.71 | 85.95 | 85.78 |
| 2012-05-16 | 89.38 | 88.01 | 87.84 | 86.06 | 85.89 |
| 2012-05-15 | 89.21 | 87.71 | 87.54 | 85.84 | 85.67 |
| 2012-05-14 | 89.01 | 87.46 | 87.26 | 85.61 | 85.41 |
| 2012-05-11 | 88.82 | 87.28 | 87.12 | 85.42 | 85.26 |
| 2012-05-10 | 88.75 | 87.2 | 86.99 | 85.37 | 85.17 |
| 2012-05-09 | 88.82 | 87.22 | 87.09 | 85.41 | 85.28 |
| 2012-05-08 | 88.75 | 87.11 | 86.91 | 85.33 | 85.13 |
| 2012-05-07 | 88.56 | 86.98 | 86.8 | 85.16 | 84.98 |
| 2012-05-04 | 88.46 | 86.8 | 86.61 | 85.03 | 84.84 |
| 2012-05-03 | 88.42 | 86.74 | 86.54 | 84.98 | 84.78 |
| 2012-05-02 | 88.31 | 86.63 | 86.43 | 84.87 | 84.68 |
| 2012-05-01 | 88.19 | 86.56 | 86.24 | 84.76 | 84.44 |
| 2012-04-30 | 88.08 | 86.47 | 86.14 | 84.66 | 84.34 |
| 2012-04-27 | 88.11 | 86.56 | 86.26 | 84.72 | 84.42 |
| 2012-04-26 | 88.27 | 86.72 | 86.5 | 84.88 | 84.67 |
| 2012-04-25 | 88.5 | 86.98 | 86.82 | 85.13 | 84.96 |
| 2012-04-24 | 88.44 | 86.91 | 86.71 | 85.05 | 84.86 |
| 2012-04-23 | 88.59 | 87.04 | 86.84 | 85.22 | 85.02 |
| 2012-04-20 | 88.52 | 87 | 86.75 | 85.17 | 84.91 |
| 2012-04-19 | 88.66 | 87.1 | 86.92 | 85.29 | 85.11 |
| 2012-04-18 | 88.62 | 87.05 | 86.89 | 85.24 | 85.08 |
| 2012-04-17 | 88.58 | 87.03 | 86.81 | 85.17 | 84.96 |
| 2012-04-16 | 88.64 | 87.06 | 86.73 | 85.24 | 84.91 |
| 2012-04-13 | 88.73 | 87.13 | 86.89 | 85.35 | 85.11 |
| 2012-04-12 | 88.51 | 86.97 | 86.71 | 85.11 | 84.86 |
| 2012-04-11 | 88.65 | 87.06 | 86.9 | 85.24 | 85.09 |
| 2012-04-10 | 88.81 | 87.17 | 86.96 | 85.36 | 85.15 |
| 2012-04-09 | 88.84 | 87.21 | 87.05 | 85.42 | 85.26 |
| 2012-04-06 | 88.92 | 87.2 | 87.01 | 85.53 | 85.34 |
| 2012-04-05 | 88.92 | 87.2 | 87.01 | 85.53 | 85.34 |
| 2012-04-04 | 88.91 | 87.2 | 87.23 | 85.5 | 85.53 |
| 2012-04-03 | 88.43 | 86.7 | 86.62 | 85.01 | 84.93 |
| 2012-04-02 | 88.4 | 86.74 | 86.72 | 85.01 | 84.98 |
| 2012-03-30 | 88.44 | 86.83 | 86.86 | 85.05 | 85.08 |
| 2012-03-29 | 88.53 | 86.93 | 86.88 | 85.13 | 85.08 |
| 2012-03-28 | 88.54 | 86.95 | 86.91 | 85.17 | 85.13 |
| 2012-03-27 | 88.47 | 86.87 | 86.76 | 85.09 | 84.98 |
| 2012-03-26 | 88.39 | 86.88 | 86.69 | 85.03 | 84.84 |
| 2012-03-23 | 88.53 | 86.92 | 86.82 | 85.14 | 85.03 |
| 2012-03-22 | 88.71 | 87.02 | 87.09 | 85.31 | 85.38 |
| 2012-03-21 | 88.71 | 87.04 | 86.89 | 85.34 | 85.2 |
| 2012-03-20 | 88.59 | 86.92 | 86.77 | 85.26 | 85.12 |
| 2012-03-19 | 88.46 | 86.79 | 86.53 | 85.13 | 84.88 |
| 2012-03-16 | 88.52 | 86.87 | 86.73 | 85.19 | 85.06 |
| 2012-03-15 | 88.77 | 87.08 | 86.88 | 85.42 | 85.21 |
| 2012-03-14 | 88.99 | 87.25 | 87.04 | 85.62 | 85.42 |
| 2012-03-13 | 88.41 | 86.66 | 86.62 | 85.03 | 84.99 |
| 2012-03-12 | 88.68 | 86.91 | 86.59 | 85.24 | 84.93 |
| 2012-03-09 | 88.72 | 86.94 | 86.66 | 85.31 | 85.04 |
| 2012-03-08 | 88.28 | 86.51 | 86.17 | 84.84 | 84.51 |
| 2012-03-07 | 88.56 | 86.81 | 86.6 | 85.11 | 84.91 |
| 2012-03-06 | 88.49 | 86.7 | 86.58 | 85.02 | 84.9 |
| 2012-03-05 | 88.38 | 86.62 | 86.37 | 84.95 | 84.7 |
| 2012-03-02 | 88.4 | 86.64 | 86.42 | 84.99 | 84.78 |
| 2012-03-01 | 88.03 | 86.32 | 86.08 | 84.61 | 84.36 |
| 2012-02-29 | 87.93 | 86.21 | 86.05 | 84.47 | 84.32 |
| 2012-02-28 | 87.9 | 86.2 | 85.97 | 84.41 | 84.18 |
| 2012-02-27 | 88 | 86.33 | 86.06 | 84.5 | 84.24 |
| 2012-02-24 | 87.94 | 86.23 | 86.01 | 84.43 | 84.22 |
| 2012-02-23 | 88.12 | 86.44 | 86.24 | 84.63 | 84.44 |
| 2012-02-22 | 88.35 | 86.64 | 86.46 | 84.88 | 84.71 |
| 2012-02-21 | 88.06 | 86.36 | 86.23 | 84.61 | 84.48 |
| 2012-02-20 | 87.97 | 86.33 | 86.05 | 84.57 | 84.29 |
| 2012-02-17 | 88.24 | 86.58 | 86.35 | 84.82 | 84.59 |
| 2012-02-16 | 88.36 | 86.73 | 86.54 | 84.93 | 84.74 |
| 2012-02-15 | 88.3 | 86.54 | 86.28 | 84.81 | 84.56 |
| 2012-02-14 | 88.2 | 86.45 | 86.28 | 84.7 | 84.54 |
| 2012-02-13 | 87.77 | 86.04 | 85.87 | 84.27 | 84.1 |
| 2012-02-10 | 87.97 | 86.24 | 86.01 | 84.46 | 84.24 |
| 2012-02-09 | 87.54 | 85.8 | 85.58 | 84.05 | 83.84 |
| 2012-02-08 | 87.64 | 85.89 | 85.59 | 84.14 | 83.84 |
| 2012-02-07 | 87.58 | 85.89 | 85.5 | 84.11 | 83.73 |
| 2012-02-06 | 87.78 | 86.06 | 85.7 | 84.3 | 83.95 |
| 2012-02-03 | 87.72 | 86.03 | 85.69 | 84.28 | 83.95 |
| 2012-02-02 | 87.6 | 85.89 | 85.59 | 84.12 | 83.82 |
| 2012-02-01 | 87.56 | 85.93 | 85.59 | 84.09 | 83.76 |
| 2012-01-31 | 87.85 | 86.12 | 85.81 | 84.34 | 84.03 |
| 2012-01-30 | 87.78 | 86.1 | 85.64 | 84.3 | 83.84 |
| 2012-01-27 | 88.01 | 86.32 | 85.46 | 84.55 | 83.7 |
| 2012-01-26 | 88 | 86.32 | 85.52 | 84.57 | 83.78 |
| 2012-01-25 | 88.67 | 86.99 | 86.26 | 85.28 | 84.56 |
| 2012-01-24 | 88.46 | 86.88 | 86.26 | 85.08 | 84.48 |
| 2012-01-23 | 88.2 | 86.66 | 85.97 | 84.83 | 84.16 |
| 2012-01-20 | 88.53 | 86.96 | 86.33 | 85.17 | 84.55 |
| 2012-01-19 | 88.77 | 87.19 | 86.71 | 85.38 | 84.91 |
| 2012-01-18 | 89.13 | 87.56 | 86.96 | 85.72 | 85.13 |
| 2012-01-17 | 89.08 | 87.54 | 87.12 | 85.69 | 85.28 |
| 2012-01-16 | 89.13 | 87.64 | 87.35 | 85.72 | 85.44 |
| 2012-01-13 | 89.33 | 87.76 | 87.55 | 85.92 | 85.71 |
| 2012-01-12 | 88.89 | 87.44 | 87.19 | 85.48 | 85.23 |
| 2012-01-11 | 89.18 | 87.7 | 87.44 | 85.76 | 85.51 |
| 2012-01-10 | 88.86 | 87.4 | 87.19 | 85.45 | 85.24 |
| 2012-01-09 | 89.1 | 87.68 | 87.47 | 85.69 | 85.49 |
| 2012-01-06 | 89.2 | 87.77 | 87.61 | 85.8 | 85.64 |
| 2012-01-05 | 89 | 87.52 | 87.49 | 85.62 | 85.59 |
| 2012-01-04 | 88.62 | 87.12 | 87.17 | 85.22 | 85.26 |
| 2012-01-03 | 88.25 | 86.84 | 86.94 | 84.89 | 84.99 |
| 2012-01-02 | 88.24 | 86.78 | 87.27 | 84.86 | 85.35 |
| 2011-12-30 | 88.24 | 86.78 | 87.27 | 84.86 | 85.35 |
| 2011-12-29 | 88.61 | 87.11 | 87.32 | 85.24 | 85.44 |
| 2011-12-28 | 88.8 | 87.3 | 87.24 | 85.38 | 85.32 |
| 2011-12-27 | 88.48 | 87.03 | 86.96 | 85.05 | 84.98 |
| 2011-12-26 | 88.4 | 86.84 | 86.73 | 84.95 | 84.84 |
| 2011-12-23 | 88.4 | 86.84 | 86.73 | 84.95 | 84.84 |
| 2011-12-22 | 88.26 | 86.79 | 86.74 | 84.85 | 84.79 |
| 2011-12-21 | 88.43 | 86.86 | 86.74 | 85 | 84.88 |
| 2011-12-20 | 88.12 | 86.72 | 86.65 | 84.72 | 84.65 |
| 2011-12-19 | 88.45 | 87.07 | 87.22 | 84.99 | 85.14 |
| 2011-12-16 | 88.13 | 86.64 | 86.79 | 84.7 | 84.84 |
| 2011-12-15 | 88 | 86.51 | 86.67 | 84.55 | 84.72 |
| 2011-12-14 | 88.1 | 86.53 | 86.78 | 84.65 | 84.9 |
| 2011-12-13 | 87.85 | 86.33 | 86.41 | 84.42 | 84.5 |
| 2011-12-12 | 87.9 | 86.3 | 86.14 | 84.41 | 84.26 |
| 2011-12-09 | 87.48 | 85.92 | 85.74 | 84 | 83.83 |
| 2011-12-08 | 87.46 | 85.71 | 85.62 | 83.92 | 83.84 |
| 2011-12-07 | 87.12 | 85.4 | 85.4 | 83.65 | 83.65 |
| 2011-12-06 | 87.12 | 85.48 | 85.51 | 83.69 | 83.72 |
| 2011-12-05 | 86.85 | 85.23 | 85.28 | 83.43 | 83.48 |
| 2011-12-02 | 87.02 | 85.36 | 85.46 | 83.56 | 83.66 |
| 2011-12-01 | 86.94 | 85.23 | 85.28 | 83.47 | 83.52 |
| 2011-11-30 | 86.83 | 85.36 | 85.25 | 83.45 | 83.35 |
| 2011-11-29 | 87.32 | 85.76 | 85.75 | 83.88 | 83.88 |
| 2011-11-28 | 87.36 | 85.86 | 85.88 | 83.92 | 83.93 |
| 2011-11-25 | 87.71 | 86.18 | 86.31 | 84.17 | 84.29 |
| 2011-11-24 | 87.65 | 86.03 | 86.14 | 84.05 | 84.16 |
| 2011-11-23 | 87.72 | 86.04 | 86.24 | 84.12 | 84.31 |
| 2011-11-22 | 87.4 | 85.71 | 85.71 | 83.8 | 83.79 |
| 2011-11-21 | 87.33 | 85.6 | 85.73 | 83.74 | 83.87 |
| 2011-11-18 | 87.34 | 85.64 | 85.44 | 83.75 | 83.55 |
| 2011-11-17 | 87.31 | 85.54 | 85.41 | 83.72 | 83.6 |
| 2011-11-16 | 87.15 | 85.46 | 85.45 | 83.57 | 83.57 |
| 2011-11-15 | 87.17 | 85.38 | 85.35 | 83.59 | 83.56 |
| 2011-11-14 | 86.87 | 85.06 | 84.97 | 83.27 | 83.18 |
| 2011-11-11 | 86.68 | 84.96 | 84.96 | 83.12 | 83.12 |
| 2011-11-10 | 87.03 | 85.31 | 85.44 | 83.45 | 83.58 |
| 2011-11-09 | 86.94 | 85.08 | 85.29 | 83.37 | 83.57 |
| 2011-11-08 | 86.32 | 84.68 | 84.77 | 82.88 | 82.97 |
| 2011-11-07 | 86.25 | 84.57 | 84.83 | 82.83 | 83.09 |
| 2011-11-04 | 86.23 | 84.54 | 84.94 | 82.86 | 83.25 |
| 2011-11-03 | 86.17 | 84.62 | 84.97 | 82.77 | 83.11 |
| 2011-11-02 | 86.1 | 84.48 | 84.74 | 82.7 | 82.94 |
| 2011-11-01 | 86.26 | 84.53 | 84.99 | 82.85 | 83.3 |
| 2011-10-31 | 85.43 | 83.8 | 84.11 | 82.08 | 82.38 |
| 2011-10-28 | 84.67 | 83.01 | 83.17 | 81.22 | 81.37 |
| 2011-10-27 | 84.73 | 83.18 | 83.44 | 81.32 | 81.57 |
| 2011-10-26 | 85.65 | 84.05 | 84.51 | 82.14 | 82.59 |
| 2011-10-25 | 85.27 | 83.77 | 84.14 | 81.85 | 82.22 |
| 2011-10-24 | 85.27 | 83.81 | 84.11 | 81.86 | 82.15 |
| 2011-10-21 | 85.26 | 83.92 | 84.2 | 81.87 | 82.15 |
| 2011-10-20 | 85.79 | 84.37 | 84.71 | 82.4 | 82.73 |
| 2011-10-19 | 85.47 | 83.96 | 84.36 | 82.07 | 82.46 |
| 2011-10-18 | 85.7 | 84.26 | 84.75 | 82.29 | 82.77 |
| 2011-10-17 | 85.51 | 84 | 84.6 | 82.04 | 82.63 |
| 2011-10-14 | 85.21 | 83.95 | 84.61 | 81.86 | 82.51 |
| 2011-10-13 | 85.44 | 84.05 | 84.89 | 82 | 82.82 |
| 2011-10-12 | 85.87 | 84.6 | 85.18 | 82.44 | 83 |
| 2011-10-11 | 85.52 | 84.17 | 85.27 | 82.08 | 83.15 |
| 2011-10-10 | 86.54 | 85.24 | 85.59 | 83.05 | 83.39 |
| 2011-10-07 | 86.6 | 85.31 | 85.59 | 83.11 | 83.39 |
| 2011-10-06 | 86.9 | 85.63 | 86.04 | 83.37 | 83.77 |
| 2011-10-05 | 86.97 | 85.69 | 86.29 | 83.47 | 84.05 |
| 2011-10-04 | 86.69 | 85.35 | 86.48 | 83.12 | 84.22 |
| 2011-10-03 | 86.57 | 85.16 | 86.21 | 83.05 | 84.07 |
| 2011-09-30 | 86.01 | 84.67 | 85.93 | 82.54 | 83.76 |
| 2011-09-29 | 85.61 | 84.31 | 85.2 | 82.15 | 83.02 |
| 2011-09-28 | 86 | 84.65 | 85.13 | 82.49 | 82.96 |
| 2011-09-27 | 85.65 | 84.38 | 84.96 | 82.21 | 82.77 |
| 2011-09-26 | 85.9 | 84.68 | 85.64 | 82.39 | 83.33 |
| 2011-09-23 | 85.29 | 83.86 | 85.39 | 81.77 | 83.26 |
| 2011-09-22 | 86.27 | 84.82 | 85.6 | 82.63 | 83.38 |
| 2011-09-21 | 86.3 | 84.81 | 84.67 | 82.77 | 82.64 |
| 2011-09-20 | 85.99 | 84.6 | 84.46 | 82.56 | 82.43 |
| 2011-09-19 | 86.23 | 84.63 | 84.52 | 82.71 | 82.61 |
| 2011-09-16 | 85.87 | 84.21 | 83.93 | 82.46 | 82.19 |
| 2011-09-15 | 85.73 | 84.05 | 83.75 | 82.26 | 81.97 |
| 2011-09-14 | 86.03 | 84.17 | 83.93 | 82.5 | 82.26 |
| 2011-09-13 | 85.94 | 83.86 | 83.51 | 82.45 | 82.11 |
| 2011-09-12 | 86.04 | 83.96 | 83.73 | 82.57 | 82.34 |
| 2011-09-09 | 86.11 | 84.12 | 83.58 | 82.7 | 82.17 |
| 2011-09-08 | 85.32 | 83.45 | 82.95 | 81.97 | 81.48 |
| 2011-09-07 | 85.25 | 83.33 | 82.76 | 81.89 | 81.33 |
| 2011-09-06 | 85.35 | 83.43 | 82.82 | 81.95 | 81.35 |
| 2011-09-05 | 85.1 | 83.11 | 82.59 | 81.65 | 81.14 |
| 2011-09-02 | 84.89 | 82.84 | 82.29 | 81.41 | 80.86 |
| 2011-09-01 | 84.82 | 82.81 | 82.27 | 81.39 | 80.86 |
| 2011-08-31 | 84.48 | 82.54 | 82.07 | 81.03 | 80.57 |
| 2011-08-30 | 84.45 | 82.56 | 82.14 | 81.02 | 80.6 |
| 2011-08-29 | 84.27 | 82.41 | 82.05 | 80.84 | 80.48 |
| 2011-08-26 | 84.52 | 82.68 | 82.34 | 81.07 | 80.74 |
| 2011-08-25 | 84.7 | 82.86 | 82.49 | 81.21 | 80.85 |
| 2011-08-24 | 84.5 | 82.63 | 82.19 | 81 | 80.57 |
| 2011-08-23 | 84.42 | 82.51 | 82 | 80.91 | 80.42 |
| 2011-08-22 | 84.54 | 82.64 | 82.1 | 81 | 80.48 |
| 2011-08-19 | 84.32 | 82.47 | 82.07 | 80.78 | 80.39 |
| 2011-08-18 | 84.66 | 82.63 | 82.29 | 81.1 | 80.76 |
| 2011-08-17 | 84.25 | 82.32 | 81.91 | 80.77 | 80.36 |
| 2011-08-16 | 84.44 | 82.45 | 82.12 | 80.93 | 80.6 |
| 2011-08-15 | 84.32 | 82.41 | 82.06 | 80.8 | 80.45 |
| 2011-08-12 | 84.85 | 82.84 | 82.54 | 81.29 | 80.99 |
| 2011-08-11 | 84.69 | 82.71 | 82.47 | 81.14 | 80.9 |
| 2011-08-10 | 84.59 | 82.52 | 82.26 | 80.98 | 80.72 |
| 2011-08-09 | 84.38 | 82.45 | 82.31 | 80.85 | 80.72 |
| 2011-08-08 | 84.44 | 82.45 | 82.18 | 80.9 | 80.63 |
| 2011-08-05 | 84.36 | 82.23 | 81.99 | 80.82 | 80.59 |
| 2011-08-04 | 84.56 | 82.36 | 81.99 | 81.01 | 80.64 |
| 2011-08-03 | 83.84 | 81.65 | 81.33 | 80.22 | 79.91 |
| 2011-08-02 | 83.88 | 81.63 | 81.26 | 80.31 | 79.94 |
| 2011-08-01 | 83.77 | 81.53 | 81.16 | 80.19 | 79.83 |
| 2011-07-29 | 83.45 | 81.34 | 81.07 | 79.95 | 79.68 |
| 2011-07-28 | 83.47 | 81.33 | 81.13 | 79.99 | 79.79 |
| 2011-07-27 | 83.41 | 81.25 | 81.02 | 79.91 | 79.68 |
| 2011-07-26 | 83.32 | 81.17 | 80.97 | 79.81 | 79.61 |
| 2011-07-25 | 83.61 | 81.48 | 81.32 | 80.12 | 79.96 |
| 2011-07-22 | 83.57 | 81.43 | 81.26 | 80.11 | 79.93 |
| 2011-07-21 | 83.5 | 81.39 | 81.25 | 80.05 | 79.91 |
| 2011-07-20 | 83.97 | 81.81 | 81.54 | 80.5 | 80.24 |
| 2011-07-19 | 83.89 | 81.76 | 81.59 | 80.43 | 80.25 |
| 2011-07-18 | 84.24 | 82.08 | 81.91 | 80.78 | 80.62 |
| 2011-07-15 | 84.12 | 81.97 | 81.76 | 80.67 | 80.46 |
| 2011-07-14 | 84.04 | 81.93 | 81.78 | 80.62 | 80.47 |
| 2011-07-13 | 83.89 | 81.84 | 81.66 | 80.51 | 80.34 |
| 2011-07-12 | 84.36 | 82.3 | 82.15 | 80.97 | 80.83 |
| 2011-07-11 | 84.62 | 82.47 | 82.25 | 81.24 | 81.02 |
| 2011-07-08 | 84.2 | 82.12 | 81.85 | 80.85 | 80.58 |
| 2011-07-07 | 84.05 | 82.09 | 81.88 | 80.75 | 80.54 |
| 2011-07-06 | 84.17 | 82.15 | 81.96 | 80.83 | 80.63 |
| 2011-07-05 | 83.99 | 82.03 | 81.76 | 80.65 | 80.39 |
| 2011-07-04 | 83.89 | 81.92 | 81.67 | 80.55 | 80.31 |
| 2011-07-01 | 83.94 | 82.01 | 81.77 | 80.63 | 80.39 |
| 2011-06-30 | 83.84 | 81.93 | 81.77 | 80.53 | 80.38 |
| 2011-06-29 | 84.08 | 82.22 | 82.09 | 80.77 | 80.64 |
| 2011-06-28 | 84.18 | 82.34 | 82.21 | 80.85 | 80.72 |
| 2011-06-27 | 84.29 | 82.44 | 82.32 | 80.95 | 80.83 |
| 2011-06-24 | 84.48 | 82.55 | 82.31 | 81.11 | 80.88 |
| 2011-06-23 | 84.57 | 82.58 | 82.4 | 81.17 | 80.99 |
| 2011-06-22 | 83.92 | 81.99 | 81.82 | 80.53 | 80.36 |
| 2011-06-21 | 83.96 | 82.08 | 81.94 | 80.6 | 80.46 |
| 2011-06-20 | 84.05 | 82.23 | 82 | 80.7 | 80.47 |
| 2011-06-17 | 84.08 | 82.27 | 82.01 | 80.74 | 80.48 |
| 2011-06-16 | 84.32 | 82.5 | 82.45 | 80.98 | 80.93 |
| 2011-06-15 | 83.91 | 82.1 | 81.93 | 80.59 | 80.43 |
| 2011-06-14 | 83.67 | 81.87 | 81.63 | 80.33 | 80.1 |
| 2011-06-13 | 83.86 | 82.01 | 81.81 | 80.47 | 80.27 |
| 2011-06-10 | 83.91 | 82 | 81.82 | 80.49 | 80.31 |
| 2011-06-09 | 83.58 | 81.75 | 81.61 | 80.2 | 80.07 |
| 2011-06-08 | 83.46 | 81.61 | 81.42 | 80.07 | 79.87 |
| 2011-06-07 | 83.31 | 81.53 | 81.26 | 79.96 | 79.69 |
| 2011-06-06 | 83.5 | 81.68 | 81.38 | 80.14 | 79.84 |
| 2011-06-03 | 83.56 | 81.74 | 81.51 | 80.22 | 79.99 |
| 2011-06-02 | 83.84 | 82 | 81.74 | 80.5 | 80.24 |
| 2011-06-01 | 83.79 | 81.9 | 81.69 | 80.44 | 80.24 |
| 2011-05-31 | 83.92 | 82.05 | 81.87 | 80.58 | 80.4 |
| 2011-05-30 | 83.95 | 82.11 | 81.93 | 80.64 | 80.46 |
| 2011-05-27 | 83.88 | 82.07 | 81.88 | 80.58 | 80.4 |
| 2011-05-26 | 84.34 | 82.51 | 82.34 | 81.02 | 80.85 |
| 2011-05-25 | 84.49 | 82.8 | 82.68 | 81.22 | 81.09 |
| 2011-05-24 | 84.44 | 82.69 | 82.51 | 81.17 | 81 |
| 2011-05-23 | 84.47 | 82.73 | 82.56 | 81.18 | 81.02 |
| 2011-05-20 | 84.22 | 82.35 | 82.2 | 80.9 | 80.75 |
| 2011-05-19 | 84.1 | 82.29 | 82.01 | 80.8 | 80.52 |
| 2011-05-18 | 84.02 | 82.22 | 81.95 | 80.7 | 80.44 |
| 2011-05-17 | 84.29 | 82.44 | 82.12 | 80.94 | 80.62 |
| 2011-05-16 | 83.9 | 82.08 | 81.88 | 80.53 | 80.34 |
| 2011-05-13 | 84.13 | 82.21 | 81.93 | 80.7 | 80.42 |
| 2011-05-12 | 84.05 | 82.16 | 81.9 | 80.66 | 80.41 |
| 2011-05-11 | 83.97 | 82.03 | 81.62 | 80.59 | 80.19 |
| 2011-05-10 | 83.75 | 81.91 | 81.58 | 80.39 | 80.06 |
| 2011-05-09 | 83.94 | 82.06 | 81.74 | 80.56 | 80.25 |
| 2011-05-06 | 83.53 | 81.72 | 81.38 | 80.17 | 79.83 |
| 2011-05-05 | 83.48 | 81.48 | 81.08 | 79.98 | 79.59 |
| 2011-05-04 | 83.09 | 81.2 | 80.74 | 79.66 | 79.2 |
| 2011-05-03 | 83.1 | 81.2 | 80.67 | 79.72 | 79.19 |
| 2011-05-02 | 83.01 | 81.14 | 80.59 | 79.67 | 79.13 |
| 2011-04-29 | 83.12 | 81.29 | 80.75 | 79.77 | 79.25 |
| 2011-04-28 | 83.04 | 81.2 | 80.75 | 79.7 | 79.26 |
| 2011-04-27 | 83.48 | 81.68 | 81.27 | 80.18 | 79.78 |
| 2011-04-26 | 83.28 | 81.51 | 80.98 | 79.94 | 79.41 |
| 2011-04-25 | 83.58 | 81.74 | 81.11 | 80.23 | 79.61 |
| 2011-04-22 | 83.44 | 81.63 | 81.12 | 80.12 | 79.62 |
| 2011-04-21 | 83.44 | 81.63 | 81.12 | 80.12 | 79.62 |
| 2011-04-20 | 83.58 | 81.77 | 81.37 | 80.28 | 79.89 |
| 2011-04-19 | 83.89 | 82.09 | 81.78 | 80.56 | 80.26 |
| 2011-04-18 | 84.06 | 82.18 | 81.94 | 80.7 | 80.46 |
| 2011-04-15 | 83.79 | 82.02 | 81.71 | 80.51 | 80.2 |
| 2011-04-14 | 83.72 | 81.91 | 81.65 | 80.42 | 80.17 |
| 2011-04-13 | 83.92 | 82.09 | 81.73 | 80.6 | 80.25 |
| 2011-04-12 | 83.83 | 82 | 81.7 | 80.46 | 80.16 |
| 2011-04-11 | 84.01 | 82.15 | 81.79 | 80.71 | 80.36 |
| 2011-04-08 | 84.15 | 82.27 | 81.92 | 80.85 | 80.5 |
| 2011-04-07 | 84.28 | 82.42 | 82.17 | 80.99 | 80.75 |
| 2011-04-06 | 84.25 | 82.38 | 82.11 | 80.96 | 80.7 |
| 2011-04-05 | 84.36 | 82.47 | 82.19 | 81.03 | 80.76 |
| 2011-04-04 | 84.26 | 82.32 | 82.04 | 80.9 | 80.62 |
| 2011-04-01 | 84.39 | 82.49 | 82.29 | 81.06 | 80.86 |
| 2011-03-31 | 84.13 | 82.27 | 82.04 | 80.75 | 80.53 |
| 2011-03-30 | 84.17 | 82.36 | 82.2 | 80.8 | 80.64 |
| 2011-03-29 | 84.11 | 82.31 | 82.14 | 80.69 | 80.52 |
| 2011-03-28 | 83.93 | 82.15 | 81.94 | 80.47 | 80.27 |
| 2011-03-25 | 83.79 | 82 | 81.85 | 80.3 | 80.15 |
| 2011-03-24 | 83.69 | 81.94 | 81.74 | 80.17 | 79.97 |
| 2011-03-23 | 83.95 | 82.17 | 81.98 | 80.39 | 80.2 |
| 2011-03-22 | 83.85 | 82.06 | 81.83 | 80.29 | 80.07 |
| 2011-03-21 | 83.87 | 82.08 | 81.94 | 80.3 | 80.16 |
| 2011-03-18 | 84.02 | 82.19 | 82.03 | 80.41 | 80.26 |
| 2011-03-17 | 83.94 | 82.05 | 81.84 | 80.18 | 79.98 |
| 2011-03-16 | 84.38 | 82.47 | 82.27 | 80.68 | 80.49 |
| 2011-03-15 | 84.33 | 82.54 | 82.33 | 80.72 | 80.52 |
| 2011-03-14 | 84.22 | 82.48 | 82.27 | 80.7 | 80.49 |
| 2011-03-11 | 84.45 | 82.66 | 82.43 | 80.95 | 80.73 |
| 2011-03-10 | 84.8 | 82.94 | 82.68 | 81.29 | 81.04 |
| 2011-03-09 | 84.5 | 82.65 | 82.32 | 81.01 | 80.69 |
| 2011-03-08 | 84.58 | 82.72 | 82.42 | 81.07 | 80.78 |
| 2011-03-07 | 84.26 | 82.46 | 82.19 | 80.76 | 80.5 |
| 2011-03-04 | 84.31 | 82.46 | 82.19 | 80.82 | 80.55 |
| 2011-03-03 | 84.36 | 82.56 | 82.25 | 80.87 | 80.57 |
| 2011-03-02 | 84.27 | 82.54 | 82.28 | 80.78 | 80.52 |
| 2011-03-01 | 84.48 | 82.77 | 82.48 | 81.03 | 80.74 |
| 2011-02-28 | 84.41 | 82.73 | 82.5 | 80.99 | 80.77 |
| 2011-02-25 | 84.46 | 82.74 | 82.56 | 81.03 | 80.86 |
| 2011-02-24 | 84.48 | 82.78 | 82.56 | 81.04 | 80.82 |
| 2011-02-23 | 84.76 | 83 | 82.76 | 81.34 | 81.1 |
| 2011-02-22 | 84.89 | 83.17 | 82.87 | 81.49 | 81.2 |
| 2011-02-21 | 85.05 | 83.25 | 82.96 | 81.65 | 81.37 |
| 2011-02-18 | 85.1 | 83.27 | 82.9 | 81.74 | 81.37 |
| 2011-02-17 | 85.16 | 83.36 | 82.89 | 81.8 | 81.33 |
| 2011-02-16 | 85.49 | 83.67 | 83.16 | 82.11 | 81.61 |
| 2011-02-15 | 85.3 | 83.51 | 83.14 | 81.95 | 81.6 |
| 2011-02-14 | 85.26 | 83.46 | 83.1 | 81.88 | 81.53 |
| 2011-02-11 | 85.18 | 83.46 | 83.09 | 81.82 | 81.46 |
| 2011-02-10 | 85.16 | 83.37 | 82.92 | 81.81 | 81.38 |
| 2011-02-09 | 84.79 | 82.96 | 82.42 | 81.44 | 80.91 |
| 2011-02-08 | 84.83 | 82.95 | 82.27 | 81.45 | 80.78 |
| 2011-02-07 | 85.04 | 83.16 | 82.58 | 81.67 | 81.1 |
| 2011-02-04 | 84.98 | 83.2 | 82.62 | 81.62 | 81.05 |
| 2011-02-03 | 84.86 | 83.07 | 82.49 | 81.47 | 80.91 |
| 2011-02-02 | 84.55 | 82.78 | 82.21 | 81.16 | 80.6 |
| 2011-02-01 | 84.41 | 82.71 | 82.25 | 81.08 | 80.64 |
| 2011-01-31 | 84.64 | 82.89 | 82.48 | 81.26 | 80.87 |
| 2011-01-28 | 84.93 | 83.07 | 82.86 | 81.54 | 81.33 |
| 2011-01-27 | 84.88 | 83.05 | 82.81 | 81.5 | 81.27 |
| 2011-01-26 | 84.85 | 83.02 | 82.78 | 81.45 | 81.21 |
| 2011-01-25 | 84.93 | 83.12 | 82.87 | 81.54 | 81.3 |
| 2011-01-24 | 84.9 | 83.15 | 82.9 | 81.54 | 81.29 |
| 2011-01-21 | 85.1 | 83.31 | 83.08 | 81.7 | 81.47 |
| 2011-01-20 | 85.54 | 83.64 | 83.41 | 82.1 | 81.87 |
| 2011-01-19 | 85.03 | 83.11 | 82.9 | 81.62 | 81.41 |
| 2011-01-18 | 85.37 | 83.49 | 83.23 | 81.97 | 81.72 |
| 2011-01-17 | 85.54 | 83.61 | 83.28 | 82.1 | 81.77 |
| 2011-01-14 | 85.56 | 83.59 | 83.26 | 82.11 | 81.78 |
| 2011-01-13 | 85.52 | 83.58 | 83.06 | 82.1 | 81.58 |
| 2011-01-12 | 86.09 | 84.13 | 83.65 | 82.66 | 82.19 |
| 2011-01-11 | 86.43 | 84.49 | 83.83 | 83.02 | 82.37 |
| 2011-01-10 | 86.12 | 84.21 | 83.5 | 82.73 | 82.02 |
| 2011-01-07 | 85.96 | 84.06 | 83.49 | 82.58 | 82.02 |
| 2011-01-06 | 86.07 | 84.14 | 83.49 | 82.68 | 82.04 |
| 2011-01-05 | 85.98 | 84.12 | 83.47 | 82.58 | 81.95 |
| 2011-01-04 | 85.41 | 83.55 | 83 | 82 | 81.46 |